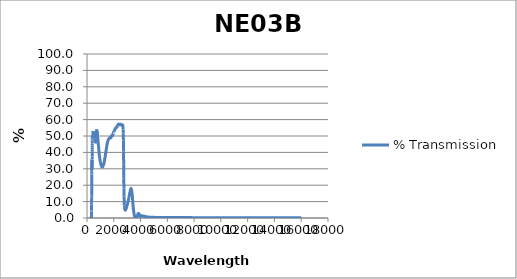
| Category | % Transmission |
|---|---|
| 200.0 | 0.014 |
| 201.0 | 0.014 |
| 202.0 | 0.014 |
| 203.0 | 0.014 |
| 204.0 | 0.014 |
| 205.0 | 0.014 |
| 206.0 | 0.014 |
| 207.0 | 0.013 |
| 208.0 | 0.014 |
| 209.0 | 0.013 |
| 210.0 | 0.013 |
| 211.0 | 0.013 |
| 212.0 | 0.013 |
| 213.0 | 0.013 |
| 214.0 | 0.013 |
| 215.0 | 0.013 |
| 216.0 | 0.013 |
| 217.0 | 0.012 |
| 218.0 | 0.012 |
| 219.0 | 0.012 |
| 220.0 | 0.012 |
| 221.0 | 0.012 |
| 222.0 | 0.012 |
| 223.0 | 0.012 |
| 224.0 | 0.012 |
| 225.0 | 0.012 |
| 226.0 | 0.012 |
| 227.0 | 0.012 |
| 228.0 | 0.012 |
| 229.0 | 0.011 |
| 230.0 | 0.011 |
| 231.0 | 0.011 |
| 232.0 | 0.011 |
| 233.0 | 0.011 |
| 234.0 | 0.011 |
| 235.0 | 0.011 |
| 236.0 | 0.011 |
| 237.0 | 0.011 |
| 238.0 | 0.011 |
| 239.0 | 0.011 |
| 240.0 | 0.011 |
| 241.0 | 0.011 |
| 242.0 | 0.011 |
| 243.0 | 0.011 |
| 244.0 | 0.011 |
| 245.0 | 0.01 |
| 246.0 | 0.01 |
| 247.0 | 0.01 |
| 248.0 | 0.01 |
| 249.0 | 0.01 |
| 250.0 | 0.01 |
| 251.0 | 0.01 |
| 252.0 | 0.01 |
| 253.0 | 0.01 |
| 254.0 | 0.01 |
| 255.0 | 0.01 |
| 256.0 | 0.01 |
| 257.0 | 0.01 |
| 258.0 | 0.01 |
| 259.0 | 0.01 |
| 260.0 | 0.01 |
| 261.0 | 0.01 |
| 262.0 | 0.01 |
| 263.0 | 0.01 |
| 264.0 | 0.01 |
| 265.0 | 0.01 |
| 266.0 | 0.01 |
| 267.0 | 0.01 |
| 268.0 | 0.01 |
| 269.0 | 0.009 |
| 270.0 | 0.009 |
| 271.0 | 0.009 |
| 272.0 | 0.009 |
| 273.0 | 0.009 |
| 274.0 | 0.009 |
| 275.0 | 0.009 |
| 276.0 | 0.009 |
| 277.0 | 0.009 |
| 278.0 | 0.009 |
| 279.0 | 0.009 |
| 280.0 | 0.009 |
| 281.0 | 0.009 |
| 282.0 | 0.009 |
| 283.0 | 0.009 |
| 284.0 | 0.009 |
| 285.0 | 0.009 |
| 286.0 | 0.009 |
| 287.0 | 0.009 |
| 288.0 | 0.009 |
| 289.0 | 0.009 |
| 290.0 | 0.009 |
| 291.0 | 0.009 |
| 292.0 | 0.009 |
| 293.0 | 0.009 |
| 294.0 | 0.009 |
| 295.0 | 0.009 |
| 296.0 | 0.009 |
| 297.0 | 0.009 |
| 298.0 | 0.009 |
| 299.0 | 0.009 |
| 300.0 | 0.009 |
| 301.0 | 0.009 |
| 302.0 | 0.009 |
| 303.0 | 0.009 |
| 304.0 | 0.009 |
| 305.0 | 0.009 |
| 306.0 | 0.009 |
| 307.0 | 0.009 |
| 308.0 | 0.008 |
| 309.0 | 0.009 |
| 310.0 | 0.009 |
| 311.0 | 0.008 |
| 312.0 | 0.008 |
| 313.0 | 0.008 |
| 314.0 | 0.008 |
| 315.0 | 0.008 |
| 316.0 | 0.009 |
| 317.0 | 0.009 |
| 318.0 | 0.01 |
| 319.0 | 0.01 |
| 320.0 | 0.013 |
| 321.0 | 0.018 |
| 322.0 | 0.026 |
| 323.0 | 0.039 |
| 324.0 | 0.06 |
| 325.0 | 0.092 |
| 326.0 | 0.138 |
| 327.0 | 0.206 |
| 328.0 | 0.3 |
| 329.0 | 0.424 |
| 330.0 | 0.588 |
| 331.0 | 0.796 |
| 332.0 | 1.056 |
| 333.0 | 1.367 |
| 334.0 | 1.736 |
| 335.0 | 2.16 |
| 336.0 | 2.658 |
| 337.0 | 3.246 |
| 338.0 | 3.903 |
| 339.0 | 4.662 |
| 340.0 | 5.47 |
| 341.0 | 6.323 |
| 342.0 | 7.248 |
| 343.0 | 8.2 |
| 344.0 | 9.247 |
| 345.0 | 10.342 |
| 346.0 | 11.501 |
| 347.0 | 12.595 |
| 348.0 | 13.826 |
| 349.0 | 15.064 |
| 350.0 | 16.359 |
| 351.0 | 17.702 |
| 352.0 | 18.977 |
| 353.0 | 20.066 |
| 354.0 | 21.304 |
| 355.0 | 22.543 |
| 356.0 | 23.813 |
| 357.0 | 25.089 |
| 358.0 | 26.323 |
| 359.0 | 27.287 |
| 360.0 | 28.412 |
| 361.0 | 29.467 |
| 362.0 | 30.585 |
| 363.0 | 31.574 |
| 364.0 | 32.527 |
| 365.0 | 33.163 |
| 366.0 | 33.889 |
| 367.0 | 34.378 |
| 368.0 | 34.846 |
| 369.0 | 35.214 |
| 370.0 | 35.203 |
| 371.0 | 34.632 |
| 372.0 | 33.98 |
| 373.0 | 33.103 |
| 374.0 | 32.112 |
| 375.0 | 31.255 |
| 376.0 | 30.477 |
| 377.0 | 29.872 |
| 378.0 | 30.061 |
| 379.0 | 30.628 |
| 380.0 | 31.579 |
| 381.0 | 32.708 |
| 382.0 | 34.15 |
| 383.0 | 35.709 |
| 384.0 | 37.46 |
| 385.0 | 39.023 |
| 386.0 | 40.515 |
| 387.0 | 41.68 |
| 388.0 | 43.062 |
| 389.0 | 44.163 |
| 390.0 | 45.363 |
| 391.0 | 46.266 |
| 392.0 | 47.028 |
| 393.0 | 47.401 |
| 394.0 | 48.068 |
| 395.0 | 48.579 |
| 396.0 | 49.251 |
| 397.0 | 49.554 |
| 398.0 | 49.923 |
| 399.0 | 49.828 |
| 400.0 | 49.993 |
| 401.0 | 50.052 |
| 402.0 | 50.28 |
| 403.0 | 50.276 |
| 404.0 | 50.241 |
| 405.0 | 49.819 |
| 406.0 | 49.731 |
| 407.0 | 49.61 |
| 408.0 | 49.769 |
| 409.0 | 49.521 |
| 410.0 | 49.354 |
| 411.0 | 49.016 |
| 412.0 | 49.022 |
| 413.0 | 48.95 |
| 414.0 | 49.072 |
| 415.0 | 49.078 |
| 416.0 | 49.085 |
| 417.0 | 48.899 |
| 418.0 | 49.005 |
| 419.0 | 49.172 |
| 420.0 | 49.361 |
| 421.0 | 49.67 |
| 422.0 | 49.698 |
| 423.0 | 49.586 |
| 424.0 | 49.761 |
| 425.0 | 49.93 |
| 426.0 | 50.146 |
| 427.0 | 50.463 |
| 428.0 | 50.457 |
| 429.0 | 50.325 |
| 430.0 | 50.357 |
| 431.0 | 50.438 |
| 432.0 | 50.513 |
| 433.0 | 50.598 |
| 434.0 | 50.408 |
| 435.0 | 50.159 |
| 436.0 | 50.026 |
| 437.0 | 49.959 |
| 438.0 | 50.012 |
| 439.0 | 50.141 |
| 440.0 | 50.025 |
| 441.0 | 49.801 |
| 442.0 | 49.821 |
| 443.0 | 49.996 |
| 444.0 | 50.21 |
| 445.0 | 50.537 |
| 446.0 | 50.626 |
| 447.0 | 50.609 |
| 448.0 | 50.818 |
| 449.0 | 51.058 |
| 450.0 | 51.382 |
| 451.0 | 51.848 |
| 452.0 | 51.931 |
| 453.0 | 51.883 |
| 454.0 | 52.029 |
| 455.0 | 52.154 |
| 456.0 | 52.44 |
| 457.0 | 52.794 |
| 458.0 | 52.805 |
| 459.0 | 52.655 |
| 460.0 | 52.642 |
| 461.0 | 52.72 |
| 462.0 | 52.88 |
| 463.0 | 53.048 |
| 464.0 | 52.906 |
| 465.0 | 52.661 |
| 466.0 | 52.652 |
| 467.0 | 52.599 |
| 468.0 | 52.668 |
| 469.0 | 52.792 |
| 470.0 | 52.51 |
| 471.0 | 52.223 |
| 472.0 | 52.172 |
| 473.0 | 52.153 |
| 474.0 | 52.211 |
| 475.0 | 52.153 |
| 476.0 | 52.008 |
| 477.0 | 51.759 |
| 478.0 | 51.635 |
| 479.0 | 51.54 |
| 480.0 | 51.632 |
| 481.0 | 51.638 |
| 482.0 | 51.442 |
| 483.0 | 51.12 |
| 484.0 | 50.993 |
| 485.0 | 50.902 |
| 486.0 | 50.982 |
| 487.0 | 51.07 |
| 488.0 | 50.827 |
| 489.0 | 50.538 |
| 490.0 | 50.462 |
| 491.0 | 50.414 |
| 492.0 | 50.501 |
| 493.0 | 50.585 |
| 494.0 | 50.355 |
| 495.0 | 50.195 |
| 496.0 | 50.166 |
| 497.0 | 50.18 |
| 498.0 | 50.316 |
| 499.0 | 50.312 |
| 500.0 | 50.098 |
| 501.0 | 49.834 |
| 502.0 | 49.814 |
| 503.0 | 49.844 |
| 504.0 | 49.964 |
| 505.0 | 50.103 |
| 506.0 | 49.922 |
| 507.0 | 49.738 |
| 508.0 | 49.728 |
| 509.0 | 49.702 |
| 510.0 | 49.874 |
| 511.0 | 50.043 |
| 512.0 | 49.87 |
| 513.0 | 49.754 |
| 514.0 | 49.786 |
| 515.0 | 49.833 |
| 516.0 | 50.054 |
| 517.0 | 50.256 |
| 518.0 | 50.112 |
| 519.0 | 49.988 |
| 520.0 | 50.031 |
| 521.0 | 50.125 |
| 522.0 | 50.347 |
| 523.0 | 50.521 |
| 524.0 | 50.415 |
| 525.0 | 50.32 |
| 526.0 | 50.399 |
| 527.0 | 50.5 |
| 528.0 | 50.76 |
| 529.0 | 50.966 |
| 530.0 | 50.83 |
| 531.0 | 50.766 |
| 532.0 | 50.853 |
| 533.0 | 50.944 |
| 534.0 | 51.182 |
| 535.0 | 51.368 |
| 536.0 | 51.292 |
| 537.0 | 51.208 |
| 538.0 | 51.283 |
| 539.0 | 51.363 |
| 540.0 | 51.6 |
| 541.0 | 51.739 |
| 542.0 | 51.536 |
| 543.0 | 51.411 |
| 544.0 | 51.455 |
| 545.0 | 51.616 |
| 546.0 | 51.775 |
| 547.0 | 51.834 |
| 548.0 | 51.569 |
| 549.0 | 51.405 |
| 550.0 | 51.415 |
| 551.0 | 51.516 |
| 552.0 | 51.643 |
| 553.0 | 51.465 |
| 554.0 | 51.311 |
| 555.0 | 51.22 |
| 556.0 | 51.185 |
| 557.0 | 51.281 |
| 558.0 | 51.319 |
| 559.0 | 51.228 |
| 560.0 | 50.945 |
| 561.0 | 50.91 |
| 562.0 | 50.691 |
| 563.0 | 50.565 |
| 564.0 | 50.425 |
| 565.0 | 50.486 |
| 566.0 | 50.448 |
| 567.0 | 50.165 |
| 568.0 | 49.896 |
| 569.0 | 49.688 |
| 570.0 | 49.528 |
| 571.0 | 49.481 |
| 572.0 | 49.548 |
| 573.0 | 49.334 |
| 574.0 | 49.08 |
| 575.0 | 48.873 |
| 576.0 | 48.7 |
| 577.0 | 48.682 |
| 578.0 | 48.678 |
| 579.0 | 48.463 |
| 580.0 | 48.151 |
| 581.0 | 47.982 |
| 582.0 | 47.892 |
| 583.0 | 47.937 |
| 584.0 | 47.905 |
| 585.0 | 47.715 |
| 586.0 | 47.536 |
| 587.0 | 47.36 |
| 588.0 | 47.275 |
| 589.0 | 47.338 |
| 590.0 | 47.389 |
| 591.0 | 47.251 |
| 592.0 | 47.117 |
| 593.0 | 47.097 |
| 594.0 | 47.013 |
| 595.0 | 47.184 |
| 596.0 | 47.241 |
| 597.0 | 47.159 |
| 598.0 | 47.036 |
| 599.0 | 47.1 |
| 600.0 | 47.089 |
| 601.0 | 47.143 |
| 602.0 | 47.265 |
| 603.0 | 47.211 |
| 604.0 | 47.138 |
| 605.0 | 47.184 |
| 606.0 | 47.17 |
| 607.0 | 47.335 |
| 608.0 | 47.443 |
| 609.0 | 47.417 |
| 610.0 | 47.297 |
| 611.0 | 47.459 |
| 612.0 | 47.386 |
| 613.0 | 47.545 |
| 614.0 | 47.607 |
| 615.0 | 47.536 |
| 616.0 | 47.449 |
| 617.0 | 47.44 |
| 618.0 | 47.477 |
| 619.0 | 47.622 |
| 620.0 | 47.72 |
| 621.0 | 47.565 |
| 622.0 | 47.48 |
| 623.0 | 47.577 |
| 624.0 | 47.503 |
| 625.0 | 47.725 |
| 626.0 | 47.716 |
| 627.0 | 47.442 |
| 628.0 | 47.328 |
| 629.0 | 47.364 |
| 630.0 | 47.28 |
| 631.0 | 47.306 |
| 632.0 | 47.269 |
| 633.0 | 47.047 |
| 634.0 | 46.931 |
| 635.0 | 46.951 |
| 636.0 | 46.897 |
| 637.0 | 46.901 |
| 638.0 | 46.944 |
| 639.0 | 46.66 |
| 640.0 | 46.58 |
| 641.0 | 46.533 |
| 642.0 | 46.532 |
| 643.0 | 46.539 |
| 644.0 | 46.479 |
| 645.0 | 46.301 |
| 646.0 | 46.253 |
| 647.0 | 46.279 |
| 648.0 | 46.226 |
| 649.0 | 46.308 |
| 650.0 | 46.308 |
| 651.0 | 46.084 |
| 652.0 | 46.082 |
| 653.0 | 46.029 |
| 654.0 | 46.089 |
| 655.0 | 46.281 |
| 656.0 | 46.433 |
| 657.0 | 46.065 |
| 658.0 | 46.104 |
| 659.0 | 46.282 |
| 660.0 | 46.304 |
| 661.0 | 46.564 |
| 662.0 | 46.492 |
| 663.0 | 46.442 |
| 664.0 | 46.481 |
| 665.0 | 46.658 |
| 666.0 | 46.778 |
| 667.0 | 46.996 |
| 668.0 | 47.238 |
| 669.0 | 47.171 |
| 670.0 | 47.266 |
| 671.0 | 47.411 |
| 672.0 | 47.78 |
| 673.0 | 48.032 |
| 674.0 | 48.091 |
| 675.0 | 48.146 |
| 676.0 | 48.224 |
| 677.0 | 48.476 |
| 678.0 | 48.71 |
| 679.0 | 49.147 |
| 680.0 | 49.333 |
| 681.0 | 49.328 |
| 682.0 | 49.61 |
| 683.0 | 50.004 |
| 684.0 | 50.211 |
| 685.0 | 50.629 |
| 686.0 | 50.604 |
| 687.0 | 50.673 |
| 688.0 | 50.789 |
| 689.0 | 51.332 |
| 690.0 | 51.318 |
| 691.0 | 51.495 |
| 692.0 | 51.78 |
| 693.0 | 51.987 |
| 694.0 | 51.916 |
| 695.0 | 52.163 |
| 696.0 | 52.185 |
| 697.0 | 52.548 |
| 698.0 | 52.895 |
| 699.0 | 52.685 |
| 700.0 | 52.648 |
| 701.0 | 52.909 |
| 702.0 | 52.943 |
| 703.0 | 53.177 |
| 704.0 | 53.384 |
| 705.0 | 53.326 |
| 706.0 | 53.218 |
| 707.0 | 53.258 |
| 708.0 | 53.182 |
| 709.0 | 53.518 |
| 710.0 | 53.795 |
| 711.0 | 53.37 |
| 712.0 | 53.522 |
| 713.0 | 53.528 |
| 714.0 | 53.445 |
| 715.0 | 53.717 |
| 716.0 | 53.782 |
| 717.0 | 53.567 |
| 718.0 | 53.452 |
| 719.0 | 53.52 |
| 720.0 | 53.381 |
| 721.0 | 53.597 |
| 722.0 | 53.607 |
| 723.0 | 53.375 |
| 724.0 | 53.234 |
| 725.0 | 53.186 |
| 726.0 | 53.221 |
| 727.0 | 53.286 |
| 728.0 | 53.362 |
| 729.0 | 53.059 |
| 730.0 | 52.958 |
| 731.0 | 52.881 |
| 732.0 | 52.763 |
| 733.0 | 52.855 |
| 734.0 | 53.055 |
| 735.0 | 52.667 |
| 736.0 | 52.59 |
| 737.0 | 52.579 |
| 738.0 | 52.407 |
| 739.0 | 52.568 |
| 740.0 | 52.704 |
| 741.0 | 52.263 |
| 742.0 | 52.17 |
| 743.0 | 52.139 |
| 744.0 | 52.057 |
| 745.0 | 52.009 |
| 746.0 | 52.232 |
| 747.0 | 51.893 |
| 748.0 | 51.625 |
| 749.0 | 51.569 |
| 750.0 | 52.508 |
| 751.0 | 52.475 |
| 752.0 | 52.434 |
| 753.0 | 52.403 |
| 754.0 | 52.374 |
| 755.0 | 52.345 |
| 756.0 | 52.318 |
| 757.0 | 52.283 |
| 758.0 | 52.236 |
| 759.0 | 52.202 |
| 760.0 | 52.168 |
| 761.0 | 52.132 |
| 762.0 | 52.099 |
| 763.0 | 52.055 |
| 764.0 | 52.001 |
| 765.0 | 51.963 |
| 766.0 | 51.925 |
| 767.0 | 51.885 |
| 768.0 | 51.844 |
| 769.0 | 51.801 |
| 770.0 | 51.744 |
| 771.0 | 51.697 |
| 772.0 | 51.658 |
| 773.0 | 51.617 |
| 774.0 | 51.532 |
| 775.0 | 51.446 |
| 776.0 | 51.359 |
| 777.0 | 51.271 |
| 778.0 | 51.182 |
| 779.0 | 51.093 |
| 780.0 | 51.003 |
| 781.0 | 50.912 |
| 782.0 | 50.821 |
| 783.0 | 50.728 |
| 784.0 | 50.635 |
| 785.0 | 50.542 |
| 786.0 | 50.448 |
| 787.0 | 50.353 |
| 788.0 | 50.258 |
| 789.0 | 50.162 |
| 790.0 | 50.067 |
| 791.0 | 49.971 |
| 792.0 | 49.875 |
| 793.0 | 49.78 |
| 794.0 | 49.685 |
| 795.0 | 49.589 |
| 796.0 | 49.495 |
| 797.0 | 49.4 |
| 798.0 | 49.304 |
| 799.0 | 49.209 |
| 800.0 | 49.114 |
| 801.0 | 49.018 |
| 802.0 | 48.923 |
| 803.0 | 48.828 |
| 804.0 | 48.732 |
| 805.0 | 48.637 |
| 806.0 | 48.543 |
| 807.0 | 48.449 |
| 808.0 | 48.355 |
| 809.0 | 48.261 |
| 810.0 | 48.168 |
| 811.0 | 48.075 |
| 812.0 | 47.983 |
| 813.0 | 47.889 |
| 814.0 | 47.796 |
| 815.0 | 47.703 |
| 816.0 | 47.61 |
| 817.0 | 47.518 |
| 818.0 | 47.425 |
| 819.0 | 47.332 |
| 820.0 | 47.238 |
| 821.0 | 47.146 |
| 822.0 | 47.053 |
| 823.0 | 46.962 |
| 824.0 | 46.87 |
| 825.0 | 46.777 |
| 826.0 | 46.685 |
| 827.0 | 46.594 |
| 828.0 | 46.502 |
| 829.0 | 46.411 |
| 830.0 | 46.319 |
| 831.0 | 46.228 |
| 832.0 | 46.136 |
| 833.0 | 46.045 |
| 834.0 | 45.955 |
| 835.0 | 45.865 |
| 836.0 | 45.777 |
| 837.0 | 45.689 |
| 838.0 | 45.601 |
| 839.0 | 45.513 |
| 840.0 | 45.425 |
| 841.0 | 45.338 |
| 842.0 | 45.252 |
| 843.0 | 45.166 |
| 844.0 | 45.08 |
| 845.0 | 44.994 |
| 846.0 | 44.909 |
| 847.0 | 44.824 |
| 848.0 | 44.741 |
| 849.0 | 44.658 |
| 850.0 | 44.576 |
| 851.0 | 44.493 |
| 852.0 | 44.411 |
| 853.0 | 44.33 |
| 854.0 | 44.249 |
| 855.0 | 44.169 |
| 856.0 | 44.09 |
| 857.0 | 44.01 |
| 858.0 | 43.929 |
| 859.0 | 43.849 |
| 860.0 | 43.769 |
| 861.0 | 43.69 |
| 862.0 | 43.611 |
| 863.0 | 43.53 |
| 864.0 | 43.449 |
| 865.0 | 43.367 |
| 866.0 | 43.285 |
| 867.0 | 43.203 |
| 868.0 | 43.118 |
| 869.0 | 43.031 |
| 870.0 | 42.942 |
| 871.0 | 42.85 |
| 872.0 | 42.758 |
| 873.0 | 42.662 |
| 874.0 | 42.563 |
| 875.0 | 42.462 |
| 876.0 | 42.359 |
| 877.0 | 42.257 |
| 878.0 | 42.155 |
| 879.0 | 42.05 |
| 880.0 | 41.944 |
| 881.0 | 41.836 |
| 882.0 | 41.724 |
| 883.0 | 41.61 |
| 884.0 | 41.493 |
| 885.0 | 41.376 |
| 886.0 | 41.257 |
| 887.0 | 41.138 |
| 888.0 | 41.019 |
| 889.0 | 40.902 |
| 890.0 | 40.786 |
| 891.0 | 40.673 |
| 892.0 | 40.562 |
| 893.0 | 40.453 |
| 894.0 | 40.344 |
| 895.0 | 40.237 |
| 896.0 | 40.137 |
| 897.0 | 40.044 |
| 898.0 | 39.954 |
| 899.0 | 39.866 |
| 900.0 | 39.776 |
| 901.0 | 39.684 |
| 902.0 | 39.594 |
| 903.0 | 39.506 |
| 904.0 | 39.422 |
| 905.0 | 39.341 |
| 906.0 | 39.263 |
| 907.0 | 39.188 |
| 908.0 | 39.116 |
| 909.0 | 39.046 |
| 910.0 | 38.978 |
| 911.0 | 38.913 |
| 912.0 | 38.849 |
| 913.0 | 38.785 |
| 914.0 | 38.719 |
| 915.0 | 38.652 |
| 916.0 | 38.59 |
| 917.0 | 38.53 |
| 918.0 | 38.469 |
| 919.0 | 38.404 |
| 920.0 | 38.337 |
| 921.0 | 38.267 |
| 922.0 | 38.193 |
| 923.0 | 38.121 |
| 924.0 | 38.053 |
| 925.0 | 37.99 |
| 926.0 | 37.927 |
| 927.0 | 37.862 |
| 928.0 | 37.797 |
| 929.0 | 37.736 |
| 930.0 | 37.677 |
| 931.0 | 37.614 |
| 932.0 | 37.553 |
| 933.0 | 37.497 |
| 934.0 | 37.436 |
| 935.0 | 37.369 |
| 936.0 | 37.303 |
| 937.0 | 37.24 |
| 938.0 | 37.182 |
| 939.0 | 37.123 |
| 940.0 | 37.062 |
| 941.0 | 36.999 |
| 942.0 | 36.936 |
| 943.0 | 36.874 |
| 944.0 | 36.818 |
| 945.0 | 36.767 |
| 946.0 | 36.717 |
| 947.0 | 36.662 |
| 948.0 | 36.604 |
| 949.0 | 36.547 |
| 950.0 | 36.495 |
| 951.0 | 36.445 |
| 952.0 | 36.388 |
| 953.0 | 36.329 |
| 954.0 | 36.276 |
| 955.0 | 36.222 |
| 956.0 | 36.161 |
| 957.0 | 36.101 |
| 958.0 | 36.046 |
| 959.0 | 35.992 |
| 960.0 | 35.939 |
| 961.0 | 35.884 |
| 962.0 | 35.827 |
| 963.0 | 35.769 |
| 964.0 | 35.716 |
| 965.0 | 35.668 |
| 966.0 | 35.62 |
| 967.0 | 35.568 |
| 968.0 | 35.513 |
| 969.0 | 35.46 |
| 970.0 | 35.411 |
| 971.0 | 35.366 |
| 972.0 | 35.316 |
| 973.0 | 35.258 |
| 974.0 | 35.2 |
| 975.0 | 35.148 |
| 976.0 | 35.1 |
| 977.0 | 35.05 |
| 978.0 | 34.998 |
| 979.0 | 34.95 |
| 980.0 | 34.905 |
| 981.0 | 34.861 |
| 982.0 | 34.816 |
| 983.0 | 34.769 |
| 984.0 | 34.722 |
| 985.0 | 34.676 |
| 986.0 | 34.632 |
| 987.0 | 34.587 |
| 988.0 | 34.539 |
| 989.0 | 34.491 |
| 990.0 | 34.441 |
| 991.0 | 34.393 |
| 992.0 | 34.347 |
| 993.0 | 34.297 |
| 994.0 | 34.248 |
| 995.0 | 34.205 |
| 996.0 | 34.169 |
| 997.0 | 34.131 |
| 998.0 | 34.091 |
| 999.0 | 34.049 |
| 1000.0 | 34.005 |
| 1001.0 | 33.962 |
| 1002.0 | 33.921 |
| 1003.0 | 33.882 |
| 1004.0 | 33.842 |
| 1005.0 | 33.802 |
| 1006.0 | 33.763 |
| 1007.0 | 33.722 |
| 1008.0 | 33.683 |
| 1009.0 | 33.646 |
| 1010.0 | 33.609 |
| 1011.0 | 33.572 |
| 1012.0 | 33.536 |
| 1013.0 | 33.507 |
| 1014.0 | 33.478 |
| 1015.0 | 33.449 |
| 1016.0 | 33.422 |
| 1017.0 | 33.39 |
| 1018.0 | 33.353 |
| 1019.0 | 33.316 |
| 1020.0 | 33.281 |
| 1021.0 | 33.251 |
| 1022.0 | 33.221 |
| 1023.0 | 33.191 |
| 1024.0 | 33.157 |
| 1025.0 | 33.123 |
| 1026.0 | 33.088 |
| 1027.0 | 33.052 |
| 1028.0 | 33.017 |
| 1029.0 | 32.984 |
| 1030.0 | 32.955 |
| 1031.0 | 32.923 |
| 1032.0 | 32.889 |
| 1033.0 | 32.854 |
| 1034.0 | 32.822 |
| 1035.0 | 32.788 |
| 1036.0 | 32.752 |
| 1037.0 | 32.714 |
| 1038.0 | 32.675 |
| 1039.0 | 32.636 |
| 1040.0 | 32.602 |
| 1041.0 | 32.571 |
| 1042.0 | 32.536 |
| 1043.0 | 32.5 |
| 1044.0 | 32.462 |
| 1045.0 | 32.426 |
| 1046.0 | 32.394 |
| 1047.0 | 32.366 |
| 1048.0 | 32.338 |
| 1049.0 | 32.311 |
| 1050.0 | 32.286 |
| 1051.0 | 32.264 |
| 1052.0 | 32.242 |
| 1053.0 | 32.216 |
| 1054.0 | 32.19 |
| 1055.0 | 32.163 |
| 1056.0 | 32.134 |
| 1057.0 | 32.107 |
| 1058.0 | 32.083 |
| 1059.0 | 32.056 |
| 1060.0 | 32.028 |
| 1061.0 | 31.999 |
| 1062.0 | 31.971 |
| 1063.0 | 31.946 |
| 1064.0 | 31.926 |
| 1065.0 | 31.911 |
| 1066.0 | 31.895 |
| 1067.0 | 31.876 |
| 1068.0 | 31.855 |
| 1069.0 | 31.832 |
| 1070.0 | 31.808 |
| 1071.0 | 31.786 |
| 1072.0 | 31.76 |
| 1073.0 | 31.732 |
| 1074.0 | 31.705 |
| 1075.0 | 31.678 |
| 1076.0 | 31.654 |
| 1077.0 | 31.632 |
| 1078.0 | 31.614 |
| 1079.0 | 31.6 |
| 1080.0 | 31.585 |
| 1081.0 | 31.572 |
| 1082.0 | 31.562 |
| 1083.0 | 31.556 |
| 1084.0 | 31.552 |
| 1085.0 | 31.545 |
| 1086.0 | 31.531 |
| 1087.0 | 31.513 |
| 1088.0 | 31.493 |
| 1089.0 | 31.476 |
| 1090.0 | 31.464 |
| 1091.0 | 31.453 |
| 1092.0 | 31.443 |
| 1093.0 | 31.433 |
| 1094.0 | 31.425 |
| 1095.0 | 31.422 |
| 1096.0 | 31.418 |
| 1097.0 | 31.412 |
| 1098.0 | 31.404 |
| 1099.0 | 31.394 |
| 1100.0 | 31.386 |
| 1101.0 | 31.377 |
| 1102.0 | 31.367 |
| 1103.0 | 31.355 |
| 1104.0 | 31.34 |
| 1105.0 | 31.324 |
| 1106.0 | 31.307 |
| 1107.0 | 31.29 |
| 1108.0 | 31.277 |
| 1109.0 | 31.268 |
| 1110.0 | 31.258 |
| 1111.0 | 31.244 |
| 1112.0 | 31.227 |
| 1113.0 | 31.21 |
| 1114.0 | 31.193 |
| 1115.0 | 31.178 |
| 1116.0 | 31.165 |
| 1117.0 | 31.155 |
| 1118.0 | 31.142 |
| 1119.0 | 31.131 |
| 1120.0 | 31.121 |
| 1121.0 | 31.112 |
| 1122.0 | 31.106 |
| 1123.0 | 31.102 |
| 1124.0 | 31.1 |
| 1125.0 | 31.099 |
| 1126.0 | 31.096 |
| 1127.0 | 31.095 |
| 1128.0 | 31.095 |
| 1129.0 | 31.097 |
| 1130.0 | 31.102 |
| 1131.0 | 31.106 |
| 1132.0 | 31.109 |
| 1133.0 | 31.113 |
| 1134.0 | 31.12 |
| 1135.0 | 31.13 |
| 1136.0 | 31.143 |
| 1137.0 | 31.156 |
| 1138.0 | 31.167 |
| 1139.0 | 31.174 |
| 1140.0 | 31.177 |
| 1141.0 | 31.179 |
| 1142.0 | 31.181 |
| 1143.0 | 31.181 |
| 1144.0 | 31.18 |
| 1145.0 | 31.175 |
| 1146.0 | 31.166 |
| 1147.0 | 31.154 |
| 1148.0 | 31.146 |
| 1149.0 | 31.142 |
| 1150.0 | 31.142 |
| 1151.0 | 31.139 |
| 1152.0 | 31.135 |
| 1153.0 | 31.127 |
| 1154.0 | 31.12 |
| 1155.0 | 31.116 |
| 1156.0 | 31.119 |
| 1157.0 | 31.125 |
| 1158.0 | 31.129 |
| 1159.0 | 31.124 |
| 1160.0 | 31.116 |
| 1161.0 | 31.109 |
| 1162.0 | 31.105 |
| 1163.0 | 31.106 |
| 1164.0 | 31.108 |
| 1165.0 | 31.113 |
| 1166.0 | 31.122 |
| 1167.0 | 31.136 |
| 1168.0 | 31.155 |
| 1169.0 | 31.18 |
| 1170.0 | 31.207 |
| 1171.0 | 31.229 |
| 1172.0 | 31.247 |
| 1173.0 | 31.261 |
| 1174.0 | 31.276 |
| 1175.0 | 31.289 |
| 1176.0 | 31.301 |
| 1177.0 | 31.31 |
| 1178.0 | 31.316 |
| 1179.0 | 31.32 |
| 1180.0 | 31.325 |
| 1181.0 | 31.335 |
| 1182.0 | 31.355 |
| 1183.0 | 31.381 |
| 1184.0 | 31.409 |
| 1185.0 | 31.438 |
| 1186.0 | 31.468 |
| 1187.0 | 31.498 |
| 1188.0 | 31.53 |
| 1189.0 | 31.564 |
| 1190.0 | 31.601 |
| 1191.0 | 31.639 |
| 1192.0 | 31.674 |
| 1193.0 | 31.706 |
| 1194.0 | 31.74 |
| 1195.0 | 31.774 |
| 1196.0 | 31.807 |
| 1197.0 | 31.841 |
| 1198.0 | 31.879 |
| 1199.0 | 31.925 |
| 1200.0 | 31.977 |
| 1201.0 | 32.031 |
| 1202.0 | 32.083 |
| 1203.0 | 32.133 |
| 1204.0 | 32.178 |
| 1205.0 | 32.22 |
| 1206.0 | 32.26 |
| 1207.0 | 32.299 |
| 1208.0 | 32.336 |
| 1209.0 | 32.369 |
| 1210.0 | 32.398 |
| 1211.0 | 32.422 |
| 1212.0 | 32.437 |
| 1213.0 | 32.442 |
| 1214.0 | 32.44 |
| 1215.0 | 32.439 |
| 1216.0 | 32.44 |
| 1217.0 | 32.443 |
| 1218.0 | 32.449 |
| 1219.0 | 32.46 |
| 1220.0 | 32.475 |
| 1221.0 | 32.489 |
| 1222.0 | 32.495 |
| 1223.0 | 32.497 |
| 1224.0 | 32.499 |
| 1225.0 | 32.502 |
| 1226.0 | 32.505 |
| 1227.0 | 32.507 |
| 1228.0 | 32.506 |
| 1229.0 | 32.498 |
| 1230.0 | 32.487 |
| 1231.0 | 32.476 |
| 1232.0 | 32.464 |
| 1233.0 | 32.453 |
| 1234.0 | 32.444 |
| 1235.0 | 32.441 |
| 1236.0 | 32.447 |
| 1237.0 | 32.459 |
| 1238.0 | 32.472 |
| 1239.0 | 32.485 |
| 1240.0 | 32.499 |
| 1241.0 | 32.513 |
| 1242.0 | 32.528 |
| 1243.0 | 32.542 |
| 1244.0 | 32.557 |
| 1245.0 | 32.578 |
| 1246.0 | 32.601 |
| 1247.0 | 32.622 |
| 1248.0 | 32.642 |
| 1249.0 | 32.664 |
| 1250.0 | 32.69 |
| 1251.0 | 32.723 |
| 1252.0 | 32.762 |
| 1253.0 | 32.806 |
| 1254.0 | 32.853 |
| 1255.0 | 32.902 |
| 1256.0 | 32.953 |
| 1257.0 | 33.005 |
| 1258.0 | 33.056 |
| 1259.0 | 33.101 |
| 1260.0 | 33.144 |
| 1261.0 | 33.191 |
| 1262.0 | 33.239 |
| 1263.0 | 33.287 |
| 1264.0 | 33.327 |
| 1265.0 | 33.359 |
| 1266.0 | 33.387 |
| 1267.0 | 33.411 |
| 1268.0 | 33.432 |
| 1269.0 | 33.451 |
| 1270.0 | 33.471 |
| 1271.0 | 33.493 |
| 1272.0 | 33.515 |
| 1273.0 | 33.535 |
| 1274.0 | 33.555 |
| 1275.0 | 33.574 |
| 1276.0 | 33.593 |
| 1277.0 | 33.614 |
| 1278.0 | 33.639 |
| 1279.0 | 33.666 |
| 1280.0 | 33.696 |
| 1281.0 | 33.73 |
| 1282.0 | 33.766 |
| 1283.0 | 33.8 |
| 1284.0 | 33.83 |
| 1285.0 | 33.857 |
| 1286.0 | 33.885 |
| 1287.0 | 33.924 |
| 1288.0 | 33.976 |
| 1289.0 | 34.035 |
| 1290.0 | 34.099 |
| 1291.0 | 34.166 |
| 1292.0 | 34.236 |
| 1293.0 | 34.308 |
| 1294.0 | 34.38 |
| 1295.0 | 34.452 |
| 1296.0 | 34.523 |
| 1297.0 | 34.593 |
| 1298.0 | 34.663 |
| 1299.0 | 34.731 |
| 1300.0 | 34.798 |
| 1301.0 | 34.864 |
| 1302.0 | 34.927 |
| 1303.0 | 34.985 |
| 1304.0 | 35.04 |
| 1305.0 | 35.097 |
| 1306.0 | 35.158 |
| 1307.0 | 35.223 |
| 1308.0 | 35.291 |
| 1309.0 | 35.359 |
| 1310.0 | 35.42 |
| 1311.0 | 35.472 |
| 1312.0 | 35.518 |
| 1313.0 | 35.563 |
| 1314.0 | 35.607 |
| 1315.0 | 35.65 |
| 1316.0 | 35.695 |
| 1317.0 | 35.74 |
| 1318.0 | 35.787 |
| 1319.0 | 35.834 |
| 1320.0 | 35.88 |
| 1321.0 | 35.925 |
| 1322.0 | 35.968 |
| 1323.0 | 36.008 |
| 1324.0 | 36.045 |
| 1325.0 | 36.085 |
| 1326.0 | 36.13 |
| 1327.0 | 36.178 |
| 1328.0 | 36.225 |
| 1329.0 | 36.268 |
| 1330.0 | 36.306 |
| 1331.0 | 36.337 |
| 1332.0 | 36.361 |
| 1333.0 | 36.385 |
| 1334.0 | 36.409 |
| 1335.0 | 36.434 |
| 1336.0 | 36.46 |
| 1337.0 | 36.486 |
| 1338.0 | 36.51 |
| 1339.0 | 36.533 |
| 1340.0 | 36.553 |
| 1341.0 | 36.577 |
| 1342.0 | 36.609 |
| 1343.0 | 36.649 |
| 1344.0 | 36.695 |
| 1345.0 | 36.744 |
| 1346.0 | 36.792 |
| 1347.0 | 36.842 |
| 1348.0 | 36.894 |
| 1349.0 | 36.951 |
| 1350.0 | 37.011 |
| 1351.0 | 37.072 |
| 1352.0 | 37.135 |
| 1353.0 | 37.198 |
| 1354.0 | 37.264 |
| 1355.0 | 37.336 |
| 1356.0 | 37.421 |
| 1357.0 | 37.518 |
| 1358.0 | 37.62 |
| 1359.0 | 37.717 |
| 1360.0 | 37.801 |
| 1361.0 | 37.875 |
| 1362.0 | 37.953 |
| 1363.0 | 38.036 |
| 1364.0 | 38.115 |
| 1365.0 | 38.185 |
| 1366.0 | 38.244 |
| 1367.0 | 38.29 |
| 1368.0 | 38.329 |
| 1369.0 | 38.374 |
| 1370.0 | 38.418 |
| 1371.0 | 38.458 |
| 1372.0 | 38.492 |
| 1373.0 | 38.526 |
| 1374.0 | 38.557 |
| 1375.0 | 38.589 |
| 1376.0 | 38.637 |
| 1377.0 | 38.706 |
| 1378.0 | 38.783 |
| 1379.0 | 38.843 |
| 1380.0 | 38.871 |
| 1381.0 | 38.878 |
| 1382.0 | 38.888 |
| 1383.0 | 38.921 |
| 1384.0 | 38.98 |
| 1385.0 | 39.036 |
| 1386.0 | 39.079 |
| 1387.0 | 39.117 |
| 1388.0 | 39.161 |
| 1389.0 | 39.218 |
| 1390.0 | 39.298 |
| 1391.0 | 39.382 |
| 1392.0 | 39.46 |
| 1393.0 | 39.538 |
| 1394.0 | 39.608 |
| 1395.0 | 39.662 |
| 1396.0 | 39.715 |
| 1397.0 | 39.784 |
| 1398.0 | 39.845 |
| 1399.0 | 39.871 |
| 1400.0 | 39.864 |
| 1401.0 | 39.851 |
| 1402.0 | 39.867 |
| 1403.0 | 39.92 |
| 1404.0 | 39.999 |
| 1405.0 | 40.09 |
| 1406.0 | 40.166 |
| 1407.0 | 40.217 |
| 1408.0 | 40.257 |
| 1409.0 | 40.305 |
| 1410.0 | 40.364 |
| 1411.0 | 40.419 |
| 1412.0 | 40.45 |
| 1413.0 | 40.457 |
| 1414.0 | 40.469 |
| 1415.0 | 40.497 |
| 1416.0 | 40.531 |
| 1417.0 | 40.582 |
| 1418.0 | 40.65 |
| 1419.0 | 40.705 |
| 1420.0 | 40.733 |
| 1421.0 | 40.774 |
| 1422.0 | 40.851 |
| 1423.0 | 40.95 |
| 1424.0 | 41.031 |
| 1425.0 | 41.075 |
| 1426.0 | 41.101 |
| 1427.0 | 41.123 |
| 1428.0 | 41.142 |
| 1429.0 | 41.166 |
| 1430.0 | 41.206 |
| 1431.0 | 41.265 |
| 1432.0 | 41.327 |
| 1433.0 | 41.38 |
| 1434.0 | 41.437 |
| 1435.0 | 41.515 |
| 1436.0 | 41.607 |
| 1437.0 | 41.694 |
| 1438.0 | 41.761 |
| 1439.0 | 41.819 |
| 1440.0 | 41.869 |
| 1441.0 | 41.924 |
| 1442.0 | 41.992 |
| 1443.0 | 42.071 |
| 1444.0 | 42.139 |
| 1445.0 | 42.192 |
| 1446.0 | 42.242 |
| 1447.0 | 42.303 |
| 1448.0 | 42.377 |
| 1449.0 | 42.451 |
| 1450.0 | 42.523 |
| 1451.0 | 42.598 |
| 1452.0 | 42.673 |
| 1453.0 | 42.747 |
| 1454.0 | 42.809 |
| 1455.0 | 42.864 |
| 1456.0 | 42.916 |
| 1457.0 | 42.96 |
| 1458.0 | 42.993 |
| 1459.0 | 43.026 |
| 1460.0 | 43.063 |
| 1461.0 | 43.11 |
| 1462.0 | 43.159 |
| 1463.0 | 43.209 |
| 1464.0 | 43.254 |
| 1465.0 | 43.293 |
| 1466.0 | 43.331 |
| 1467.0 | 43.373 |
| 1468.0 | 43.416 |
| 1469.0 | 43.456 |
| 1470.0 | 43.501 |
| 1471.0 | 43.556 |
| 1472.0 | 43.618 |
| 1473.0 | 43.674 |
| 1474.0 | 43.717 |
| 1475.0 | 43.748 |
| 1476.0 | 43.768 |
| 1477.0 | 43.795 |
| 1478.0 | 43.828 |
| 1479.0 | 43.868 |
| 1480.0 | 43.913 |
| 1481.0 | 43.963 |
| 1482.0 | 44.009 |
| 1483.0 | 44.05 |
| 1484.0 | 44.087 |
| 1485.0 | 44.127 |
| 1486.0 | 44.164 |
| 1487.0 | 44.201 |
| 1488.0 | 44.24 |
| 1489.0 | 44.289 |
| 1490.0 | 44.343 |
| 1491.0 | 44.403 |
| 1492.0 | 44.467 |
| 1493.0 | 44.526 |
| 1494.0 | 44.575 |
| 1495.0 | 44.614 |
| 1496.0 | 44.654 |
| 1497.0 | 44.699 |
| 1498.0 | 44.754 |
| 1499.0 | 44.821 |
| 1500.0 | 44.887 |
| 1501.0 | 44.953 |
| 1502.0 | 45.015 |
| 1503.0 | 45.076 |
| 1504.0 | 45.134 |
| 1505.0 | 45.191 |
| 1506.0 | 45.251 |
| 1507.0 | 45.312 |
| 1508.0 | 45.372 |
| 1509.0 | 45.431 |
| 1510.0 | 45.487 |
| 1511.0 | 45.54 |
| 1512.0 | 45.584 |
| 1513.0 | 45.621 |
| 1514.0 | 45.651 |
| 1515.0 | 45.674 |
| 1516.0 | 45.698 |
| 1517.0 | 45.726 |
| 1518.0 | 45.761 |
| 1519.0 | 45.801 |
| 1520.0 | 45.845 |
| 1521.0 | 45.89 |
| 1522.0 | 45.924 |
| 1523.0 | 45.95 |
| 1524.0 | 45.971 |
| 1525.0 | 45.993 |
| 1526.0 | 46.015 |
| 1527.0 | 46.039 |
| 1528.0 | 46.067 |
| 1529.0 | 46.097 |
| 1530.0 | 46.123 |
| 1531.0 | 46.145 |
| 1532.0 | 46.169 |
| 1533.0 | 46.193 |
| 1534.0 | 46.218 |
| 1535.0 | 46.246 |
| 1536.0 | 46.273 |
| 1537.0 | 46.301 |
| 1538.0 | 46.333 |
| 1539.0 | 46.372 |
| 1540.0 | 46.414 |
| 1541.0 | 46.452 |
| 1542.0 | 46.48 |
| 1543.0 | 46.497 |
| 1544.0 | 46.506 |
| 1545.0 | 46.523 |
| 1546.0 | 46.546 |
| 1547.0 | 46.574 |
| 1548.0 | 46.604 |
| 1549.0 | 46.639 |
| 1550.0 | 46.677 |
| 1551.0 | 46.713 |
| 1552.0 | 46.74 |
| 1553.0 | 46.768 |
| 1554.0 | 46.795 |
| 1555.0 | 46.82 |
| 1556.0 | 46.849 |
| 1557.0 | 46.882 |
| 1558.0 | 46.916 |
| 1559.0 | 46.955 |
| 1560.0 | 46.993 |
| 1561.0 | 47.024 |
| 1562.0 | 47.044 |
| 1563.0 | 47.058 |
| 1564.0 | 47.075 |
| 1565.0 | 47.105 |
| 1566.0 | 47.145 |
| 1567.0 | 47.189 |
| 1568.0 | 47.227 |
| 1569.0 | 47.261 |
| 1570.0 | 47.294 |
| 1571.0 | 47.325 |
| 1572.0 | 47.349 |
| 1573.0 | 47.362 |
| 1574.0 | 47.37 |
| 1575.0 | 47.385 |
| 1576.0 | 47.407 |
| 1577.0 | 47.438 |
| 1578.0 | 47.474 |
| 1579.0 | 47.506 |
| 1580.0 | 47.531 |
| 1581.0 | 47.546 |
| 1582.0 | 47.552 |
| 1583.0 | 47.557 |
| 1584.0 | 47.571 |
| 1585.0 | 47.595 |
| 1586.0 | 47.625 |
| 1587.0 | 47.651 |
| 1588.0 | 47.666 |
| 1589.0 | 47.675 |
| 1590.0 | 47.687 |
| 1591.0 | 47.702 |
| 1592.0 | 47.718 |
| 1593.0 | 47.731 |
| 1594.0 | 47.738 |
| 1595.0 | 47.746 |
| 1596.0 | 47.764 |
| 1597.0 | 47.79 |
| 1598.0 | 47.815 |
| 1599.0 | 47.835 |
| 1600.0 | 47.849 |
| 1601.0 | 47.857 |
| 1602.0 | 47.868 |
| 1603.0 | 47.889 |
| 1604.0 | 47.922 |
| 1605.0 | 47.961 |
| 1606.0 | 47.999 |
| 1607.0 | 48.029 |
| 1608.0 | 48.044 |
| 1609.0 | 48.05 |
| 1610.0 | 48.053 |
| 1611.0 | 48.06 |
| 1612.0 | 48.07 |
| 1613.0 | 48.078 |
| 1614.0 | 48.087 |
| 1615.0 | 48.096 |
| 1616.0 | 48.109 |
| 1617.0 | 48.126 |
| 1618.0 | 48.143 |
| 1619.0 | 48.158 |
| 1620.0 | 48.172 |
| 1621.0 | 48.185 |
| 1622.0 | 48.199 |
| 1623.0 | 48.214 |
| 1624.0 | 48.23 |
| 1625.0 | 48.24 |
| 1626.0 | 48.237 |
| 1627.0 | 48.223 |
| 1628.0 | 48.206 |
| 1629.0 | 48.195 |
| 1630.0 | 48.192 |
| 1631.0 | 48.203 |
| 1632.0 | 48.224 |
| 1633.0 | 48.251 |
| 1634.0 | 48.277 |
| 1635.0 | 48.299 |
| 1636.0 | 48.32 |
| 1637.0 | 48.342 |
| 1638.0 | 48.366 |
| 1639.0 | 48.39 |
| 1640.0 | 48.412 |
| 1641.0 | 48.431 |
| 1642.0 | 48.445 |
| 1643.0 | 48.456 |
| 1644.0 | 48.465 |
| 1645.0 | 48.473 |
| 1646.0 | 48.48 |
| 1647.0 | 48.487 |
| 1648.0 | 48.497 |
| 1649.0 | 48.513 |
| 1650.0 | 48.536 |
| 1651.0 | 48.561 |
| 1652.0 | 48.583 |
| 1653.0 | 48.6 |
| 1654.0 | 48.613 |
| 1655.0 | 48.622 |
| 1656.0 | 48.629 |
| 1657.0 | 48.638 |
| 1658.0 | 48.649 |
| 1659.0 | 48.659 |
| 1660.0 | 48.66 |
| 1661.0 | 48.654 |
| 1662.0 | 48.641 |
| 1663.0 | 48.63 |
| 1664.0 | 48.627 |
| 1665.0 | 48.631 |
| 1666.0 | 48.638 |
| 1667.0 | 48.646 |
| 1668.0 | 48.653 |
| 1669.0 | 48.661 |
| 1670.0 | 48.672 |
| 1671.0 | 48.689 |
| 1672.0 | 48.71 |
| 1673.0 | 48.73 |
| 1674.0 | 48.748 |
| 1675.0 | 48.762 |
| 1676.0 | 48.771 |
| 1677.0 | 48.773 |
| 1678.0 | 48.773 |
| 1679.0 | 48.772 |
| 1680.0 | 48.775 |
| 1681.0 | 48.783 |
| 1682.0 | 48.796 |
| 1683.0 | 48.813 |
| 1684.0 | 48.837 |
| 1685.0 | 48.866 |
| 1686.0 | 48.892 |
| 1687.0 | 48.91 |
| 1688.0 | 48.921 |
| 1689.0 | 48.932 |
| 1690.0 | 48.945 |
| 1691.0 | 48.959 |
| 1692.0 | 48.968 |
| 1693.0 | 48.966 |
| 1694.0 | 48.952 |
| 1695.0 | 48.931 |
| 1696.0 | 48.91 |
| 1697.0 | 48.892 |
| 1698.0 | 48.879 |
| 1699.0 | 48.872 |
| 1700.0 | 48.874 |
| 1701.0 | 48.882 |
| 1702.0 | 48.889 |
| 1703.0 | 48.888 |
| 1704.0 | 48.876 |
| 1705.0 | 48.859 |
| 1706.0 | 48.843 |
| 1707.0 | 48.827 |
| 1708.0 | 48.81 |
| 1709.0 | 48.796 |
| 1710.0 | 48.784 |
| 1711.0 | 48.774 |
| 1712.0 | 48.759 |
| 1713.0 | 48.74 |
| 1714.0 | 48.718 |
| 1715.0 | 48.704 |
| 1716.0 | 48.703 |
| 1717.0 | 48.714 |
| 1718.0 | 48.73 |
| 1719.0 | 48.746 |
| 1720.0 | 48.76 |
| 1721.0 | 48.772 |
| 1722.0 | 48.78 |
| 1723.0 | 48.78 |
| 1724.0 | 48.77 |
| 1725.0 | 48.752 |
| 1726.0 | 48.735 |
| 1727.0 | 48.722 |
| 1728.0 | 48.713 |
| 1729.0 | 48.709 |
| 1730.0 | 48.71 |
| 1731.0 | 48.715 |
| 1732.0 | 48.728 |
| 1733.0 | 48.746 |
| 1734.0 | 48.769 |
| 1735.0 | 48.793 |
| 1736.0 | 48.817 |
| 1737.0 | 48.837 |
| 1738.0 | 48.849 |
| 1739.0 | 48.849 |
| 1740.0 | 48.836 |
| 1741.0 | 48.819 |
| 1742.0 | 48.802 |
| 1743.0 | 48.785 |
| 1744.0 | 48.767 |
| 1745.0 | 48.75 |
| 1746.0 | 48.74 |
| 1747.0 | 48.743 |
| 1748.0 | 48.758 |
| 1749.0 | 48.781 |
| 1750.0 | 48.811 |
| 1751.0 | 48.845 |
| 1752.0 | 48.876 |
| 1753.0 | 48.898 |
| 1754.0 | 48.909 |
| 1755.0 | 48.906 |
| 1756.0 | 48.893 |
| 1757.0 | 48.876 |
| 1758.0 | 48.86 |
| 1759.0 | 48.847 |
| 1760.0 | 48.838 |
| 1761.0 | 48.832 |
| 1762.0 | 48.831 |
| 1763.0 | 48.836 |
| 1764.0 | 48.843 |
| 1765.0 | 48.852 |
| 1766.0 | 48.867 |
| 1767.0 | 48.889 |
| 1768.0 | 48.918 |
| 1769.0 | 48.947 |
| 1770.0 | 48.972 |
| 1771.0 | 48.992 |
| 1772.0 | 49.002 |
| 1773.0 | 48.998 |
| 1774.0 | 48.977 |
| 1775.0 | 48.947 |
| 1776.0 | 48.92 |
| 1777.0 | 48.903 |
| 1778.0 | 48.897 |
| 1779.0 | 48.897 |
| 1780.0 | 48.898 |
| 1781.0 | 48.899 |
| 1782.0 | 48.903 |
| 1783.0 | 48.914 |
| 1784.0 | 48.931 |
| 1785.0 | 48.952 |
| 1786.0 | 48.975 |
| 1787.0 | 49.002 |
| 1788.0 | 49.028 |
| 1789.0 | 49.048 |
| 1790.0 | 49.059 |
| 1791.0 | 49.061 |
| 1792.0 | 49.058 |
| 1793.0 | 49.051 |
| 1794.0 | 49.042 |
| 1795.0 | 49.043 |
| 1796.0 | 49.059 |
| 1797.0 | 49.092 |
| 1798.0 | 49.142 |
| 1799.0 | 49.195 |
| 1800.0 | 49.238 |
| 1801.0 | 49.276 |
| 1802.0 | 49.316 |
| 1803.0 | 49.36 |
| 1804.0 | 49.405 |
| 1805.0 | 49.443 |
| 1806.0 | 49.469 |
| 1807.0 | 49.486 |
| 1808.0 | 49.504 |
| 1809.0 | 49.526 |
| 1810.0 | 49.539 |
| 1811.0 | 49.544 |
| 1812.0 | 49.547 |
| 1813.0 | 49.556 |
| 1814.0 | 49.575 |
| 1815.0 | 49.606 |
| 1816.0 | 49.652 |
| 1817.0 | 49.705 |
| 1818.0 | 49.743 |
| 1819.0 | 49.755 |
| 1820.0 | 49.738 |
| 1821.0 | 49.711 |
| 1822.0 | 49.698 |
| 1823.0 | 49.71 |
| 1824.0 | 49.73 |
| 1825.0 | 49.739 |
| 1826.0 | 49.736 |
| 1827.0 | 49.732 |
| 1828.0 | 49.733 |
| 1829.0 | 49.741 |
| 1830.0 | 49.751 |
| 1831.0 | 49.761 |
| 1832.0 | 49.78 |
| 1833.0 | 49.815 |
| 1834.0 | 49.859 |
| 1835.0 | 49.899 |
| 1836.0 | 49.929 |
| 1837.0 | 49.943 |
| 1838.0 | 49.933 |
| 1839.0 | 49.887 |
| 1840.0 | 49.821 |
| 1841.0 | 49.776 |
| 1842.0 | 49.79 |
| 1843.0 | 49.871 |
| 1844.0 | 49.972 |
| 1845.0 | 50.029 |
| 1846.0 | 50.022 |
| 1847.0 | 49.978 |
| 1848.0 | 49.948 |
| 1849.0 | 49.956 |
| 1850.0 | 49.985 |
| 1851.0 | 50.022 |
| 1852.0 | 50.055 |
| 1853.0 | 50.084 |
| 1854.0 | 50.101 |
| 1855.0 | 50.093 |
| 1856.0 | 50.068 |
| 1857.0 | 50.047 |
| 1858.0 | 50.036 |
| 1859.0 | 50.031 |
| 1860.0 | 50.037 |
| 1861.0 | 50.068 |
| 1862.0 | 50.142 |
| 1863.0 | 50.252 |
| 1864.0 | 50.352 |
| 1865.0 | 50.392 |
| 1866.0 | 50.358 |
| 1867.0 | 50.285 |
| 1868.0 | 50.24 |
| 1869.0 | 50.261 |
| 1870.0 | 50.327 |
| 1871.0 | 50.378 |
| 1872.0 | 50.373 |
| 1873.0 | 50.327 |
| 1874.0 | 50.275 |
| 1875.0 | 50.237 |
| 1876.0 | 50.213 |
| 1877.0 | 50.203 |
| 1878.0 | 50.214 |
| 1879.0 | 50.24 |
| 1880.0 | 50.264 |
| 1881.0 | 50.291 |
| 1882.0 | 50.317 |
| 1883.0 | 50.333 |
| 1884.0 | 50.33 |
| 1885.0 | 50.304 |
| 1886.0 | 50.253 |
| 1887.0 | 50.2 |
| 1888.0 | 50.174 |
| 1889.0 | 50.175 |
| 1890.0 | 50.195 |
| 1891.0 | 50.211 |
| 1892.0 | 50.21 |
| 1893.0 | 50.218 |
| 1894.0 | 50.258 |
| 1895.0 | 50.338 |
| 1896.0 | 50.445 |
| 1897.0 | 50.538 |
| 1898.0 | 50.6 |
| 1899.0 | 50.643 |
| 1900.0 | 50.673 |
| 1901.0 | 50.697 |
| 1902.0 | 50.711 |
| 1903.0 | 50.72 |
| 1904.0 | 50.714 |
| 1905.0 | 50.704 |
| 1906.0 | 50.702 |
| 1907.0 | 50.717 |
| 1908.0 | 50.743 |
| 1909.0 | 50.784 |
| 1910.0 | 50.825 |
| 1911.0 | 50.849 |
| 1912.0 | 50.864 |
| 1913.0 | 50.884 |
| 1914.0 | 50.917 |
| 1915.0 | 50.963 |
| 1916.0 | 50.989 |
| 1917.0 | 50.976 |
| 1918.0 | 50.927 |
| 1919.0 | 50.855 |
| 1920.0 | 50.796 |
| 1921.0 | 50.771 |
| 1922.0 | 50.77 |
| 1923.0 | 50.778 |
| 1924.0 | 50.776 |
| 1925.0 | 50.768 |
| 1926.0 | 50.761 |
| 1927.0 | 50.772 |
| 1928.0 | 50.8 |
| 1929.0 | 50.831 |
| 1930.0 | 50.852 |
| 1931.0 | 50.855 |
| 1932.0 | 50.842 |
| 1933.0 | 50.824 |
| 1934.0 | 50.822 |
| 1935.0 | 50.84 |
| 1936.0 | 50.859 |
| 1937.0 | 50.866 |
| 1938.0 | 50.844 |
| 1939.0 | 50.807 |
| 1940.0 | 50.782 |
| 1941.0 | 50.79 |
| 1942.0 | 50.829 |
| 1943.0 | 50.88 |
| 1944.0 | 50.923 |
| 1945.0 | 50.955 |
| 1946.0 | 50.98 |
| 1947.0 | 51.006 |
| 1948.0 | 51.039 |
| 1949.0 | 51.08 |
| 1950.0 | 51.116 |
| 1951.0 | 51.143 |
| 1952.0 | 51.171 |
| 1953.0 | 51.198 |
| 1954.0 | 51.227 |
| 1955.0 | 51.26 |
| 1956.0 | 51.297 |
| 1957.0 | 51.333 |
| 1958.0 | 51.364 |
| 1959.0 | 51.394 |
| 1960.0 | 51.425 |
| 1961.0 | 51.471 |
| 1962.0 | 51.532 |
| 1963.0 | 51.594 |
| 1964.0 | 51.642 |
| 1965.0 | 51.671 |
| 1966.0 | 51.689 |
| 1967.0 | 51.704 |
| 1968.0 | 51.72 |
| 1969.0 | 51.743 |
| 1970.0 | 51.774 |
| 1971.0 | 51.805 |
| 1972.0 | 51.83 |
| 1973.0 | 51.849 |
| 1974.0 | 51.864 |
| 1975.0 | 51.879 |
| 1976.0 | 51.902 |
| 1977.0 | 51.937 |
| 1978.0 | 51.978 |
| 1979.0 | 52.022 |
| 1980.0 | 52.061 |
| 1981.0 | 52.092 |
| 1982.0 | 52.12 |
| 1983.0 | 52.143 |
| 1984.0 | 52.162 |
| 1985.0 | 52.174 |
| 1986.0 | 52.183 |
| 1987.0 | 52.197 |
| 1988.0 | 52.215 |
| 1989.0 | 52.23 |
| 1990.0 | 52.24 |
| 1991.0 | 52.247 |
| 1992.0 | 52.254 |
| 1993.0 | 52.261 |
| 1994.0 | 52.27 |
| 1995.0 | 52.282 |
| 1996.0 | 52.291 |
| 1997.0 | 52.295 |
| 1998.0 | 52.292 |
| 1999.0 | 52.283 |
| 2000.065834 | 52.391 |
| 2009.942668 | 52.683 |
| 2020.098566 | 52.72 |
| 2029.969298 | 52.955 |
| 2039.837 | 53.078 |
| 2049.98346 | 53.319 |
| 2059.844971 | 53.526 |
| 2069.985031 | 53.785 |
| 2079.840289 | 54 |
| 2089.973887 | 54.196 |
| 2099.822832 | 54.394 |
| 2109.949906 | 54.63 |
| 2119.792477 | 54.714 |
| 2129.912964 | 54.747 |
| 2140.030088 | 54.75 |
| 2149.862941 | 54.861 |
| 2159.973384 | 54.854 |
| 2169.799712 | 54.9 |
| 2179.903413 | 54.975 |
| 2190.003671 | 55.11 |
| 2199.820052 | 55.192 |
| 2209.913475 | 55.274 |
| 2219.723179 | 55.406 |
| 2229.809704 | 55.468 |
| 2239.892708 | 55.583 |
| 2249.692237 | 55.635 |
| 2259.76825 | 55.964 |
| 2269.840694 | 56.236 |
| 2279.909553 | 56.482 |
| 2289.695271 | 56.516 |
| 2299.757015 | 56.526 |
| 2309.815127 | 56.673 |
| 2319.869592 | 56.856 |
| 2329.641254 | 57.058 |
| 2339.688478 | 57.125 |
| 2349.732008 | 57.159 |
| 2359.771828 | 57.268 |
| 2369.80792 | 57.279 |
| 2379.840271 | 57.197 |
| 2389.590342 | 57.044 |
| 2399.615266 | 56.985 |
| 2409.6364 | 56.993 |
| 2419.65373 | 56.841 |
| 2429.667238 | 56.822 |
| 2439.676909 | 56.824 |
| 2449.682728 | 56.942 |
| 2459.684679 | 57.004 |
| 2469.682745 | 57.146 |
| 2479.676911 | 57.19 |
| 2489.667162 | 57.156 |
| 2499.653481 | 57.013 |
| 2509.635853 | 56.956 |
| 2519.614261 | 56.892 |
| 2529.588691 | 56.914 |
| 2539.559127 | 56.84 |
| 2549.525552 | 56.809 |
| 2559.487951 | 56.7 |
| 2569.722871 | 56.862 |
| 2579.677058 | 56.962 |
| 2589.627171 | 56.807 |
| 2599.573195 | 56.602 |
| 2609.515113 | 56.507 |
| 2619.452911 | 56.75 |
| 2629.662448 | 56.837 |
| 2639.591842 | 56.814 |
| 2649.517067 | 56.757 |
| 2659.438109 | 56.669 |
| 2669.630358 | 56.445 |
| 2679.542867 | 56.011 |
| 2689.451145 | 55.183 |
| 2699.630227 | 53.91 |
| 2709.529877 | 51.489 |
| 2719.425248 | 47.374 |
| 2729.591015 | 40.606 |
| 2739.477662 | 32.52 |
| 2749.359982 | 24.263 |
| 2759.512287 | 17.885 |
| 2769.385788 | 12.947 |
| 2779.528995 | 9.824 |
| 2789.393611 | 7.738 |
| 2799.527654 | 6.652 |
| 2809.383323 | 5.967 |
| 2819.508136 | 5.483 |
| 2829.354792 | 5.245 |
| 2839.47031 | 5.021 |
| 2849.30789 | 4.891 |
| 2859.414046 | 4.743 |
| 2869.515434 | 4.787 |
| 2879.339216 | 4.92 |
| 2889.431143 | 5.091 |
| 2899.24569 | 5.304 |
| 2909.328092 | 5.424 |
| 2919.40564 | 5.607 |
| 2929.206149 | 5.844 |
| 2939.274073 | 6.16 |
| 2949.337095 | 6.416 |
| 2959.395197 | 6.595 |
| 2969.17672 | 6.921 |
| 2979.225066 | 7.271 |
| 2989.268442 | 7.631 |
| 2999.306833 | 8.016 |
| 3009.34022 | 8.206 |
| 3019.368587 | 8.588 |
| 3029.391918 | 8.726 |
| 3039.139497 | 9.211 |
| 3049.152842 | 9.45 |
| 3059.1611 | 9.86 |
| 3069.164256 | 10.148 |
| 3079.162292 | 10.495 |
| 3089.155191 | 10.851 |
| 3099.142938 | 11.194 |
| 3109.125515 | 11.427 |
| 3119.102905 | 11.88 |
| 3129.075093 | 12.293 |
| 3139.311366 | 12.763 |
| 3149.272956 | 13.233 |
| 3159.229293 | 13.722 |
| 3169.18036 | 14.281 |
| 3179.126141 | 14.669 |
| 3189.066618 | 15.123 |
| 3199.27022 | 15.45 |
| 3209.199897 | 15.692 |
| 3219.124221 | 15.995 |
| 3229.043176 | 16.5 |
| 3239.224603 | 16.995 |
| 3249.132622 | 17.324 |
| 3259.035221 | 17.48 |
| 3269.199799 | 17.743 |
| 3279.091361 | 17.867 |
| 3288.977454 | 17.986 |
| 3299.125027 | 17.949 |
| 3308.999981 | 17.753 |
| 3319.136081 | 17.448 |
| 3328.999829 | 17.006 |
| 3339.124385 | 16.508 |
| 3348.976861 | 16.034 |
| 3359.089804 | 15.327 |
| 3368.930939 | 14.758 |
| 3379.0322 | 13.937 |
| 3389.127517 | 13.098 |
| 3398.951437 | 11.976 |
| 3409.034967 | 10.841 |
| 3419.112499 | 9.678 |
| 3428.919052 | 8.687 |
| 3438.984693 | 7.682 |
| 3449.044284 | 6.747 |
| 3458.833318 | 5.903 |
| 3468.880914 | 5.274 |
| 3478.922407 | 4.772 |
| 3488.957779 | 4.122 |
| 3498.987012 | 3.509 |
| 3509.010089 | 2.762 |
| 3519.026992 | 2.259 |
| 3529.037703 | 1.823 |
| 3538.779008 | 1.525 |
| 3548.777448 | 1.166 |
| 3558.769643 | 1.024 |
| 3568.755577 | 0.957 |
| 3578.997769 | 0.809 |
| 3588.970961 | 0.59 |
| 3598.937838 | 0.491 |
| 3608.898383 | 0.528 |
| 3618.852578 | 0.367 |
| 3628.800407 | 0.35 |
| 3638.74185 | 0.423 |
| 3648.938253 | 0.488 |
| 3658.866705 | 0.666 |
| 3668.788719 | 0.521 |
| 3678.704279 | 0.668 |
| 3688.874043 | 0.39 |
| 3698.776469 | 0.664 |
| 3708.672387 | 0.688 |
| 3718.821938 | 1.1 |
| 3728.704616 | 0.944 |
| 3738.840542 | 1.003 |
| 3748.709907 | 0.854 |
| 3758.832135 | 1.155 |
| 3768.688117 | 1.37 |
| 3778.796573 | 1.508 |
| 3788.639101 | 1.748 |
| 3798.733711 | 2.069 |
| 3808.821282 | 2.524 |
| 3818.643407 | 2.78 |
| 3828.717023 | 2.681 |
| 3838.783543 | 2.734 |
| 3848.585104 | 2.616 |
| 3858.637559 | 2.802 |
| 3868.682864 | 2.618 |
| 3878.720999 | 2.636 |
| 3888.751945 | 2.293 |
| 3898.518755 | 2.111 |
| 3908.535455 | 1.794 |
| 3918.54491 | 1.915 |
| 3928.547104 | 1.831 |
| 3938.542016 | 1.646 |
| 3948.52963 | 1.324 |
| 3958.509925 | 0.992 |
| 3968.482884 | 1.389 |
| 3978.70392 | 1.423 |
| 3988.661962 | 1.633 |
| 3998.612612 | 1.213 |
| 4008.555852 | 1.041 |
| 4018.491662 | 1.109 |
| 4028.6745 | 1.163 |
| 4038.595205 | 1.336 |
| 4048.508426 | 1.228 |
| 4058.414143 | 1.197 |
| 4068.56604 | 1.197 |
| 4078.456503 | 1.181 |
| 4088.592715 | 1.236 |
| 4098.467848 | 1.319 |
| 4108.588299 | 1.33 |
| 4118.448027 | 1.323 |
| 4128.552639 | 1.282 |
| 4138.396887 | 1.279 |
| 4148.485584 | 1.249 |
| 4158.566193 | 1.256 |
| 4168.386981 | 1.258 |
| 4178.45156 | 1.285 |
| 4188.507992 | 1.274 |
| 4198.305151 | 1.27 |
| 4208.345437 | 1.258 |
| 4218.377519 | 1.257 |
| 4228.401377 | 1.228 |
| 4238.416991 | 1.165 |
| 4248.424343 | 1.156 |
| 4258.423411 | 1.11 |
| 4268.414178 | 1.071 |
| 4278.396623 | 1.029 |
| 4288.370728 | 1.024 |
| 4298.336471 | 1.012 |
| 4308.293836 | 0.987 |
| 4318.2428 | 0.962 |
| 4328.431752 | 0.936 |
| 4338.363649 | 0.903 |
| 4348.287088 | 0.873 |
| 4358.20205 | 0.854 |
| 4368.356068 | 0.844 |
| 4378.253805 | 0.841 |
| 4388.390126 | 0.833 |
| 4398.270558 | 0.818 |
| 4408.389101 | 0.795 |
| 4418.252149 | 0.776 |
| 4428.352834 | 0.756 |
| 4438.198419 | 0.74 |
| 4448.281165 | 0.726 |
| 4458.354799 | 0.709 |
| 4468.173935 | 0.693 |
| 4478.229508 | 0.679 |
| 4488.275909 | 0.665 |
| 4498.313117 | 0.652 |
| 4508.096635 | 0.639 |
| 4518.115621 | 0.627 |
| 4528.125352 | 0.616 |
| 4538.125809 | 0.605 |
| 4548.11697 | 0.595 |
| 4558.098816 | 0.586 |
| 4568.071325 | 0.577 |
| 4578.277365 | 0.568 |
| 4588.230912 | 0.56 |
| 4598.175061 | 0.552 |
| 4608.109792 | 0.544 |
| 4618.035085 | 0.537 |
| 4628.192649 | 0.53 |
| 4638.098772 | 0.523 |
| 4647.995395 | 0.517 |
| 4658.123528 | 0.511 |
| 4668.000857 | 0.505 |
| 4678.109183 | 0.5 |
| 4687.967136 | 0.494 |
| 4698.05557 | 0.489 |
| 4708.133906 | 0.484 |
| 4717.962521 | 0.48 |
| 4728.020838 | 0.475 |
| 4738.068993 | 0.471 |
| 4748.106964 | 0.467 |
| 4758.13473 | 0.462 |
| 4767.913874 | 0.459 |
| 4777.921408 | 0.455 |
| 4787.918673 | 0.451 |
| 4797.905646 | 0.448 |
| 4807.882307 | 0.444 |
| 4818.085802 | 0.441 |
| 4828.041526 | 0.437 |
| 4837.986874 | 0.434 |
| 4847.921823 | 0.431 |
| 4857.846351 | 0.428 |
| 4867.996361 | 0.425 |
| 4877.899737 | 0.422 |
| 4888.028045 | 0.419 |
| 4897.910179 | 0.417 |
| 4908.016697 | 0.414 |
| 4917.877504 | 0.411 |
| 4927.962141 | 0.409 |
| 4937.801534 | 0.406 |
| 4947.864203 | 0.404 |
| 4957.915724 | 0.402 |
| 4967.956075 | 0.399 |
| 4977.985234 | 0.397 |
| 4987.77033 | 0.395 |
| 4997.777298 | 0.392 |
| 5007.776688 | 0.39 |
| 5017.595804 | 0.388 |
| 5028.169082 | 0.386 |
| 5037.98605 | 0.384 |
| 5047.80198 | 0.382 |
| 5057.616872 | 0.38 |
| 5068.18559 | 0.378 |
| 5077.998316 | 0.376 |
| 5087.809996 | 0.374 |
| 5097.620628 | 0.373 |
| 5107.430211 | 0.371 |
| 5117.993201 | 0.369 |
| 5127.800597 | 0.367 |
| 5137.606938 | 0.366 |
| 5147.41222 | 0.364 |
| 5157.970569 | 0.362 |
| 5167.773648 | 0.361 |
| 5177.575662 | 0.359 |
| 5187.376611 | 0.358 |
| 5197.930283 | 0.356 |
| 5207.729011 | 0.354 |
| 5217.526666 | 0.353 |
| 5227.323247 | 0.351 |
| 5237.872207 | 0.35 |
| 5247.666549 | 0.349 |
| 5257.459812 | 0.347 |
| 5268.005191 | 0.346 |
| 5277.796202 | 0.344 |
| 5287.586127 | 0.343 |
| 5297.374963 | 0.342 |
| 5307.915566 | 0.34 |
| 5317.702134 | 0.339 |
| 5327.487607 | 0.338 |
| 5337.271982 | 0.337 |
| 5347.807773 | 0.335 |
| 5357.589864 | 0.334 |
| 5367.370852 | 0.333 |
| 5377.902987 | 0.332 |
| 5387.681677 | 0.33 |
| 5397.459258 | 0.329 |
| 5407.235727 | 0.328 |
| 5417.762987 | 0.327 |
| 5427.537141 | 0.326 |
| 5437.310177 | 0.325 |
| 5447.833734 | 0.324 |
| 5457.604442 | 0.323 |
| 5467.374028 | 0.322 |
| 5477.142487 | 0.321 |
| 5487.661104 | 0.319 |
| 5497.427219 | 0.318 |
| 5507.192201 | 0.317 |
| 5517.707068 | 0.316 |
| 5527.469693 | 0.315 |
| 5537.231179 | 0.314 |
| 5547.742274 | 0.313 |
| 5557.50139 | 0.313 |
| 5567.259362 | 0.312 |
| 5577.766665 | 0.311 |
| 5587.522253 | 0.31 |
| 5597.276691 | 0.309 |
| 5607.780182 | 0.308 |
| 5617.532223 | 0.307 |
| 5627.283108 | 0.306 |
| 5637.032835 | 0.305 |
| 5647.531242 | 0.304 |
| 5657.278555 | 0.304 |
| 5667.024703 | 0.303 |
| 5677.51925 | 0.302 |
| 5687.262972 | 0.301 |
| 5697.005523 | 0.3 |
| 5707.496189 | 0.299 |
| 5717.236302 | 0.299 |
| 5726.975237 | 0.298 |
| 5737.462002 | 0.297 |
| 5747.198485 | 0.296 |
| 5757.682605 | 0.296 |
| 5767.416629 | 0.295 |
| 5777.149464 | 0.294 |
| 5787.629649 | 0.293 |
| 5797.360012 | 0.293 |
| 5807.08918 | 0.292 |
| 5817.565409 | 0.291 |
| 5827.292092 | 0.29 |
| 5837.017575 | 0.29 |
| 5847.489828 | 0.289 |
| 5857.212813 | 0.288 |
| 5866.934591 | 0.288 |
| 5877.402847 | 0.287 |
| 5887.122114 | 0.286 |
| 5897.587661 | 0.286 |
| 5907.304408 | 0.285 |
| 5917.019938 | 0.285 |
| 5927.481454 | 0.284 |
| 5937.194452 | 0.283 |
| 5946.906226 | 0.283 |
| 5957.363691 | 0.282 |
| 5967.072921 | 0.281 |
| 5977.52764 | 0.281 |
| 5987.234315 | 0.28 |
| 5996.939757 | 0.28 |
| 6007.39039 | 0.279 |
| 6017.093265 | 0.279 |
| 6026.794901 | 0.278 |
| 6037.241429 | 0.277 |
| 6046.940485 | 0.277 |
| 6057.38423 | 0.276 |
| 6067.080698 | 0.276 |
| 6076.775917 | 0.275 |
| 6087.215522 | 0.275 |
| 6096.908139 | 0.274 |
| 6107.344938 | 0.274 |
| 6117.034946 | 0.273 |
| 6126.723694 | 0.273 |
| 6137.156319 | 0.272 |
| 6146.842444 | 0.272 |
| 6157.272241 | 0.271 |
| 6166.955735 | 0.271 |
| 6177.382693 | 0.27 |
| 6187.063548 | 0.27 |
| 6196.743128 | 0.269 |
| 6207.165865 | 0.269 |
| 6216.842793 | 0.268 |
| 6227.262668 | 0.268 |
| 6236.936935 | 0.267 |
| 6246.609918 | 0.267 |
| 6257.025537 | 0.266 |
| 6266.695846 | 0.266 |
| 6277.108582 | 0.266 |
| 6286.776208 | 0.265 |
| 6297.18605 | 0.265 |
| 6306.850986 | 0.264 |
| 6317.257926 | 0.264 |
| 6326.920162 | 0.263 |
| 6336.581095 | 0.263 |
| 6346.983717 | 0.263 |
| 6356.641938 | 0.262 |
| 6367.041635 | 0.262 |
| 6376.697135 | 0.261 |
| 6387.093897 | 0.261 |
| 6396.746668 | 0.261 |
| 6407.140486 | 0.26 |
| 6416.790518 | 0.26 |
| 6427.181383 | 0.259 |
| 6436.828669 | 0.259 |
| 6446.47463 | 0.259 |
| 6456.861103 | 0.258 |
| 6466.504304 | 0.258 |
| 6476.8878 | 0.258 |
| 6486.528234 | 0.257 |
| 6496.908745 | 0.257 |
| 6506.546402 | 0.257 |
| 6516.923919 | 0.256 |
| 6526.558791 | 0.256 |
| 6536.933304 | 0.256 |
| 6546.565382 | 0.255 |
| 6556.936882 | 0.255 |
| 6566.566159 | 0.255 |
| 6576.934637 | 0.254 |
| 6586.561102 | 0.254 |
| 6596.926549 | 0.254 |
| 6606.550195 | 0.253 |
| 6616.912601 | 0.253 |
| 6626.53342 | 0.253 |
| 6636.892776 | 0.252 |
| 6646.510758 | 0.252 |
| 6656.867055 | 0.252 |
| 6666.482193 | 0.251 |
| 6676.835422 | 0.251 |
| 6686.447706 | 0.251 |
| 6696.797857 | 0.25 |
| 6706.40728 | 0.25 |
| 6716.754344 | 0.25 |
| 6726.360896 | 0.25 |
| 6736.704865 | 0.249 |
| 6746.308538 | 0.249 |
| 6756.649402 | 0.249 |
| 6766.250188 | 0.248 |
| 6776.587937 | 0.248 |
| 6786.924068 | 0.248 |
| 6796.520453 | 0.248 |
| 6806.853456 | 0.247 |
| 6816.446931 | 0.247 |
| 6826.776797 | 0.247 |
| 6836.367355 | 0.247 |
| 6846.694074 | 0.246 |
| 6856.281707 | 0.246 |
| 6866.60527 | 0.246 |
| 6876.189968 | 0.246 |
| 6886.510366 | 0.245 |
| 6896.82912 | 0.245 |
| 6906.409345 | 0.245 |
| 6916.724921 | 0.245 |
| 6926.30219 | 0.244 |
| 6936.614577 | 0.244 |
| 6946.188882 | 0.244 |
| 6956.498072 | 0.244 |
| 6966.805601 | 0.243 |
| 6976.375388 | 0.243 |
| 6986.679706 | 0.243 |
| 6996.246507 | 0.243 |
| 7006.547605 | 0.242 |
| 7016.111412 | 0.242 |
| 7026.40928 | 0.242 |
| 7036.70547 | 0.242 |
| 7046.264714 | 0.242 |
| 7056.557661 | 0.241 |
| 7066.113889 | 0.241 |
| 7076.403584 | 0.241 |
| 7086.691589 | 0.241 |
| 7096.243221 | 0.24 |
| 7106.527959 | 0.24 |
| 7116.076554 | 0.24 |
| 7126.358018 | 0.24 |
| 7136.637779 | 0.24 |
| 7146.181746 | 0.239 |
| 7156.458218 | 0.239 |
| 7165.999126 | 0.239 |
| 7176.2723 | 0.239 |
| 7186.54376 | 0.239 |
| 7196.080008 | 0.238 |
| 7206.348156 | 0.238 |
| 7216.614582 | 0.238 |
| 7226.14615 | 0.238 |
| 7236.409251 | 0.238 |
| 7245.937725 | 0.237 |
| 7256.197491 | 0.237 |
| 7266.455524 | 0.237 |
| 7275.979286 | 0.237 |
| 7286.23397 | 0.237 |
| 7296.486914 | 0.237 |
| 7306.005944 | 0.236 |
| 7316.255525 | 0.236 |
| 7326.503358 | 0.236 |
| 7336.017637 | 0.236 |
| 7346.262094 | 0.236 |
| 7356.504797 | 0.236 |
| 7366.014304 | 0.235 |
| 7376.253616 | 0.235 |
| 7386.491167 | 0.235 |
| 7395.995884 | 0.235 |
| 7406.23003 | 0.235 |
| 7416.462408 | 0.235 |
| 7425.962315 | 0.234 |
| 7436.191274 | 0.234 |
| 7446.418458 | 0.234 |
| 7455.913536 | 0.234 |
| 7466.137287 | 0.234 |
| 7476.359256 | 0.234 |
| 7485.849485 | 0.233 |
| 7496.068008 | 0.233 |
| 7506.284741 | 0.233 |
| 7515.770101 | 0.233 |
| 7525.983375 | 0.233 |
| 7536.19485 | 0.233 |
| 7545.675324 | 0.232 |
| 7555.883326 | 0.232 |
| 7566.089524 | 0.232 |
| 7576.293916 | 0.232 |
| 7585.767802 | 0.232 |
| 7595.968701 | 0.232 |
| 7606.167786 | 0.232 |
| 7615.636739 | 0.231 |
| 7625.832319 | 0.231 |
| 7636.026078 | 0.231 |
| 7646.218013 | 0.231 |
| 7655.680318 | 0.231 |
| 7665.868729 | 0.231 |
| 7676.05531 | 0.231 |
| 7686.240057 | 0.23 |
| 7695.695679 | 0.23 |
| 7705.876884 | 0.23 |
| 7716.056248 | 0.23 |
| 7726.23377 | 0.23 |
| 7735.682674 | 0.23 |
| 7745.856636 | 0.23 |
| 7756.028747 | 0.23 |
| 7766.199006 | 0.229 |
| 7775.641157 | 0.229 |
| 7785.807837 | 0.229 |
| 7795.972657 | 0.229 |
| 7806.135616 | 0.229 |
| 7815.57098 | 0.229 |
| 7825.730341 | 0.229 |
| 7835.887833 | 0.228 |
| 7846.043454 | 0.228 |
| 7855.471995 | 0.228 |
| 7865.624 | 0.228 |
| 7875.774127 | 0.228 |
| 7885.922372 | 0.228 |
| 7896.068734 | 0.228 |
| 7905.488668 | 0.228 |
| 7915.631391 | 0.228 |
| 7925.772224 | 0.227 |
| 7935.911164 | 0.227 |
| 7946.048209 | 0.227 |
| 7955.45948 | 0.227 |
| 7965.592863 | 0.227 |
| 7975.724343 | 0.227 |
| 7985.853919 | 0.227 |
| 7995.981587 | 0.227 |
| 8005.384141 | 0.226 |
| 8015.508125 | 0.226 |
| 8025.630194 | 0.226 |
| 8035.750346 | 0.226 |
| 8045.86858 | 0.226 |
| 8055.984892 | 0.226 |
| 8065.376887 | 0.226 |
| 8075.489487 | 0.226 |
| 8085.600158 | 0.226 |
| 8095.708897 | 0.225 |
| 8105.815704 | 0.225 |
| 8115.920574 | 0.225 |
| 8125.301933 | 0.225 |
| 8135.403063 | 0.225 |
| 8145.502251 | 0.225 |
| 8155.599493 | 0.225 |
| 8165.694787 | 0.225 |
| 8175.788131 | 0.225 |
| 8185.879523 | 0.225 |
| 8195.248351 | 0.224 |
| 8205.33597 | 0.224 |
| 8215.42163 | 0.224 |
| 8225.505327 | 0.224 |
| 8235.587061 | 0.224 |
| 8245.666827 | 0.224 |
| 8255.744624 | 0.224 |
| 8265.82045 | 0.224 |
| 8275.174806 | 0.224 |
| 8285.246822 | 0.224 |
| 8295.31686 | 0.223 |
| 8305.384917 | 0.223 |
| 8315.45099 | 0.223 |
| 8325.515077 | 0.223 |
| 8335.577176 | 0.223 |
| 8345.637284 | 0.223 |
| 8355.695399 | 0.223 |
| 8365.751519 | 0.223 |
| 8375.087555 | 0.223 |
| 8385.139819 | 0.223 |
| 8395.190081 | 0.223 |
| 8405.238338 | 0.222 |
| 8415.284587 | 0.222 |
| 8425.328827 | 0.222 |
| 8435.371055 | 0.222 |
| 8445.411268 | 0.222 |
| 8455.449464 | 0.222 |
| 8465.485641 | 0.222 |
| 8475.519796 | 0.222 |
| 8485.551927 | 0.222 |
| 8495.582031 | 0.222 |
| 8505.610107 | 0.222 |
| 8515.636151 | 0.221 |
| 8525.660162 | 0.221 |
| 8535.682136 | 0.221 |
| 8544.98643 | 0.221 |
| 8555.004471 | 0.221 |
| 8565.020468 | 0.221 |
| 8575.034421 | 0.221 |
| 8585.046325 | 0.221 |
| 8595.056179 | 0.221 |
| 8605.063981 | 0.221 |
| 8615.069727 | 0.221 |
| 8625.073416 | 0.221 |
| 8635.075045 | 0.22 |
| 8645.074612 | 0.22 |
| 8655.072114 | 0.22 |
| 8665.067549 | 0.22 |
| 8675.060915 | 0.22 |
| 8685.052209 | 0.22 |
| 8695.041429 | 0.22 |
| 8705.028573 | 0.22 |
| 8715.013637 | 0.22 |
| 8724.99662 | 0.22 |
| 8734.977519 | 0.22 |
| 8744.956333 | 0.22 |
| 8754.933058 | 0.22 |
| 8764.907692 | 0.219 |
| 8774.880232 | 0.219 |
| 8784.850677 | 0.219 |
| 8794.819025 | 0.219 |
| 8804.785271 | 0.219 |
| 8815.461059 | 0.219 |
| 8825.422948 | 0.219 |
| 8835.382728 | 0.219 |
| 8845.340399 | 0.219 |
| 8855.295957 | 0.219 |
| 8865.249401 | 0.219 |
| 8875.200727 | 0.219 |
| 8885.149933 | 0.219 |
| 8895.097018 | 0.218 |
| 8905.041978 | 0.218 |
| 8914.984812 | 0.218 |
| 8924.925517 | 0.218 |
| 8934.86409 | 0.218 |
| 8944.800529 | 0.218 |
| 8954.734832 | 0.218 |
| 8965.376355 | 0.218 |
| 8975.306225 | 0.218 |
| 8985.233952 | 0.218 |
| 8995.159534 | 0.218 |
| 9005.082967 | 0.218 |
| 9015.004249 | 0.218 |
| 9024.923378 | 0.218 |
| 9034.840353 | 0.218 |
| 9044.755169 | 0.217 |
| 9054.667825 | 0.217 |
| 9065.286129 | 0.217 |
| 9075.194303 | 0.217 |
| 9085.10031 | 0.217 |
| 9095.004147 | 0.217 |
| 9104.905813 | 0.217 |
| 9114.805303 | 0.217 |
| 9124.702617 | 0.217 |
| 9134.597752 | 0.217 |
| 9145.197262 | 0.217 |
| 9155.087875 | 0.217 |
| 9164.976302 | 0.217 |
| 9174.86254 | 0.217 |
| 9184.746587 | 0.217 |
| 9194.628441 | 0.216 |
| 9204.508098 | 0.216 |
| 9215.091006 | 0.216 |
| 9224.966108 | 0.216 |
| 9234.839006 | 0.216 |
| 9244.709699 | 0.216 |
| 9254.578185 | 0.216 |
| 9265.149109 | 0.216 |
| 9275.013013 | 0.216 |
| 9284.874702 | 0.216 |
| 9294.734174 | 0.216 |
| 9304.591426 | 0.216 |
| 9314.446456 | 0.216 |
| 9325.002949 | 0.216 |
| 9334.853368 | 0.216 |
| 9344.701558 | 0.216 |
| 9354.547517 | 0.216 |
| 9364.391241 | 0.215 |
| 9374.935607 | 0.215 |
| 9384.774696 | 0.215 |
| 9394.611544 | 0.215 |
| 9404.446148 | 0.215 |
| 9414.980732 | 0.215 |
| 9424.810682 | 0.215 |
| 9434.63838 | 0.215 |
| 9444.463825 | 0.215 |
| 9454.988585 | 0.215 |
| 9464.809356 | 0.215 |
| 9474.627866 | 0.215 |
| 9484.444114 | 0.215 |
| 9494.959008 | 0.215 |
| 9504.770561 | 0.215 |
| 9514.579844 | 0.215 |
| 9524.386855 | 0.215 |
| 9534.891842 | 0.214 |
| 9544.694139 | 0.214 |
| 9554.494156 | 0.214 |
| 9564.291891 | 0.214 |
| 9574.786929 | 0.214 |
| 9584.57993 | 0.214 |
| 9594.370643 | 0.214 |
| 9604.858149 | 0.214 |
| 9614.644112 | 0.214 |
| 9624.427779 | 0.214 |
| 9634.209147 | 0.214 |
| 9644.686632 | 0.214 |
| 9654.463232 | 0.214 |
| 9664.237526 | 0.214 |
| 9674.707423 | 0.214 |
| 9684.476934 | 0.214 |
| 9694.244132 | 0.214 |
| 9704.706417 | 0.214 |
| 9714.468817 | 0.214 |
| 9724.228897 | 0.213 |
| 9734.683548 | 0.213 |
| 9744.438814 | 0.213 |
| 9754.191753 | 0.213 |
| 9764.638746 | 0.213 |
| 9774.386857 | 0.213 |
| 9784.132634 | 0.213 |
| 9794.571945 | 0.213 |
| 9804.312879 | 0.213 |
| 9814.746996 | 0.213 |
| 9824.483078 | 0.213 |
| 9834.216813 | 0.213 |
| 9844.643209 | 0.213 |
| 9854.372076 | 0.213 |
| 9864.09859 | 0.213 |
| 9874.517241 | 0.213 |
| 9884.238873 | 0.213 |
| 9894.652288 | 0.213 |
| 9904.369027 | 0.213 |
| 9914.083402 | 0.213 |
| 9924.489032 | 0.212 |
| 9934.198499 | 0.212 |
| 9944.598867 | 0.212 |
| 9954.303417 | 0.212 |
| 9964.00559 | 0.212 |
| 9974.398135 | 0.212 |
| 9984.095376 | 0.212 |
| 9994.482631 | 0.212 |
| 10004.17493 | 0.212 |
| 10014.55689 | 0.212 |
| 10024.24423 | 0.212 |
| 10033.92919 | 0.212 |
| 10044.30326 | 0.212 |
| 10053.98325 | 0.212 |
| 10064.352 | 0.212 |
| 10074.02701 | 0.212 |
| 10084.39043 | 0.212 |
| 10094.06045 | 0.212 |
| 10104.41852 | 0.212 |
| 10114.08355 | 0.212 |
| 10124.43625 | 0.212 |
| 10134.09628 | 0.212 |
| 10144.44362 | 0.211 |
| 10154.09862 | 0.211 |
| 10164.44058 | 0.211 |
| 10174.09056 | 0.211 |
| 10184.42713 | 0.211 |
| 10194.07208 | 0.211 |
| 10204.40325 | 0.211 |
| 10214.04315 | 0.211 |
| 10224.36891 | 0.211 |
| 10234.00375 | 0.211 |
| 10244.32409 | 0.211 |
| 10253.95386 | 0.211 |
| 10264.26877 | 0.211 |
| 10273.89347 | 0.211 |
| 10284.20293 | 0.211 |
| 10293.82255 | 0.211 |
| 10304.12656 | 0.211 |
| 10313.74108 | 0.211 |
| 10324.03963 | 0.211 |
| 10334.33534 | 0.211 |
| 10343.94211 | 0.211 |
| 10354.23234 | 0.211 |
| 10363.834 | 0.211 |
| 10374.11874 | 0.21 |
| 10383.71527 | 0.21 |
| 10393.99451 | 0.21 |
| 10404.2709 | 0.21 |
| 10413.85962 | 0.21 |
| 10424.1305 | 0.21 |
| 10433.71407 | 0.21 |
| 10443.97941 | 0.21 |
| 10454.2419 | 0.21 |
| 10463.81763 | 0.21 |
| 10474.07457 | 0.21 |
| 10483.64512 | 0.21 |
| 10493.8965 | 0.21 |
| 10504.14501 | 0.21 |
| 10513.70769 | 0.21 |
| 10523.95063 | 0.21 |
| 10534.19068 | 0.21 |
| 10543.74545 | 0.21 |
| 10553.97992 | 0.21 |
| 10564.21149 | 0.21 |
| 10573.75835 | 0.21 |
| 10583.98432 | 0.21 |
| 10593.52594 | 0.21 |
| 10603.7463 | 0.21 |
| 10613.96375 | 0.21 |
| 10624.17829 | 0.21 |
| 10633.70924 | 0.209 |
| 10643.91815 | 0.209 |
| 10654.12414 | 0.209 |
| 10663.64709 | 0.209 |
| 10673.84743 | 0.209 |
| 10684.04485 | 0.209 |
| 10693.55979 | 0.209 |
| 10703.75154 | 0.209 |
| 10713.94035 | 0.209 |
| 10723.44726 | 0.209 |
| 10733.6304 | 0.209 |
| 10743.81059 | 0.209 |
| 10753.98783 | 0.209 |
| 10763.48393 | 0.209 |
| 10773.65548 | 0.209 |
| 10783.82407 | 0.209 |
| 10793.9897 | 0.209 |
| 10803.47495 | 0.209 |
| 10813.63486 | 0.209 |
| 10823.7918 | 0.209 |
| 10833.94578 | 0.209 |
| 10843.42014 | 0.209 |
| 10853.56838 | 0.209 |
| 10863.71363 | 0.209 |
| 10873.85591 | 0.209 |
| 10883.31935 | 0.209 |
| 10893.45586 | 0.209 |
| 10903.58938 | 0.208 |
| 10913.71992 | 0.208 |
| 10923.84746 | 0.208 |
| 10933.29714 | 0.208 |
| 10943.41889 | 0.208 |
| 10953.53764 | 0.208 |
| 10963.65339 | 0.208 |
| 10973.76613 | 0.208 |
| 10983.87586 | 0.208 |
| 10993.3089 | 0.208 |
| 11003.41281 | 0.208 |
| 11013.5137 | 0.208 |
| 11023.61157 | 0.208 |
| 11033.70642 | 0.208 |
| 11043.79825 | 0.208 |
| 11053.21456 | 0.208 |
| 11063.30053 | 0.208 |
| 11073.38346 | 0.208 |
| 11083.46337 | 0.208 |
| 11093.54023 | 0.208 |
| 11103.61405 | 0.208 |
| 11113.68483 | 0.208 |
| 11123.75256 | 0.208 |
| 11133.14635 | 0.208 |
| 11143.20819 | 0.208 |
| 11153.26696 | 0.208 |
| 11163.32268 | 0.208 |
| 11173.37534 | 0.208 |
| 11183.42494 | 0.208 |
| 11193.47147 | 0.208 |
| 11203.51493 | 0.208 |
| 11213.55532 | 0.207 |
| 11223.59263 | 0.207 |
| 11233.62687 | 0.207 |
| 11243.65803 | 0.207 |
| 11253.6861 | 0.207 |
| 11263.71109 | 0.207 |
| 11273.06496 | 0.207 |
| 11283.08398 | 0.207 |
| 11293.09991 | 0.207 |
| 11303.11274 | 0.207 |
| 11313.12247 | 0.207 |
| 11323.12909 | 0.207 |
| 11333.13262 | 0.207 |
| 11343.13303 | 0.207 |
| 11353.13034 | 0.207 |
| 11363.12453 | 0.207 |
| 11373.11561 | 0.207 |
| 11383.10358 | 0.207 |
| 11393.08842 | 0.207 |
| 11403.07013 | 0.207 |
| 11413.04872 | 0.207 |
| 11423.02418 | 0.207 |
| 11432.99651 | 0.207 |
| 11442.96571 | 0.207 |
| 11452.93177 | 0.207 |
| 11463.55877 | 0.207 |
| 11473.51834 | 0.207 |
| 11483.47476 | 0.207 |
| 11493.42803 | 0.207 |
| 11503.37815 | 0.207 |
| 11513.32512 | 0.207 |
| 11523.26893 | 0.207 |
| 11533.20958 | 0.207 |
| 11543.14707 | 0.207 |
| 11553.0814 | 0.206 |
| 11563.01256 | 0.206 |
| 11572.94055 | 0.206 |
| 11582.86536 | 0.206 |
| 11593.44833 | 0.206 |
| 11603.36658 | 0.206 |
| 11613.28165 | 0.206 |
| 11623.19353 | 0.206 |
| 11633.10223 | 0.206 |
| 11643.00774 | 0.206 |
| 11652.91006 | 0.206 |
| 11662.80918 | 0.206 |
| 11673.36472 | 0.206 |
| 11683.25723 | 0.206 |
| 11693.14654 | 0.206 |
| 11703.03264 | 0.206 |
| 11712.91554 | 0.206 |
| 11722.79522 | 0.206 |
| 11733.33001 | 0.206 |
| 11743.20304 | 0.206 |
| 11753.07286 | 0.206 |
| 11762.93946 | 0.206 |
| 11772.80283 | 0.206 |
| 11783.3202 | 0.206 |
| 11793.1769 | 0.206 |
| 11803.03036 | 0.206 |
| 11812.88059 | 0.206 |
| 11822.72758 | 0.206 |
| 11833.22747 | 0.206 |
| 11843.06776 | 0.206 |
| 11852.9048 | 0.206 |
| 11862.73859 | 0.206 |
| 11873.22439 | 0.206 |
| 11883.05145 | 0.206 |
| 11892.87526 | 0.206 |
| 11902.69581 | 0.206 |
| 11913.16747 | 0.206 |
| 11922.98127 | 0.205 |
| 11932.79181 | 0.205 |
| 11942.59907 | 0.205 |
| 11953.05654 | 0.205 |
| 11962.85704 | 0.205 |
| 11972.65425 | 0.205 |
| 11983.10099 | 0.205 |
| 11992.89142 | 0.205 |
| 12002.67856 | 0.205 |
| 12013.11455 | 0.205 |
| 12022.89488 | 0.205 |
| 12032.67192 | 0.205 |
| 12043.09713 | 0.205 |
| 12052.86735 | 0.205 |
| 12062.63426 | 0.205 |
| 12073.04866 | 0.205 |
| 12082.80874 | 0.205 |
| 12092.5655 | 0.205 |
| 12102.96906 | 0.205 |
| 12112.71897 | 0.205 |
| 12122.46556 | 0.205 |
| 12132.85826 | 0.205 |
| 12142.59798 | 0.205 |
| 12152.98334 | 0.205 |
| 12162.71618 | 0.205 |
| 12172.44568 | 0.205 |
| 12182.82013 | 0.205 |
| 12192.54273 | 0.205 |
| 12202.90982 | 0.205 |
| 12212.62551 | 0.205 |
| 12222.98523 | 0.205 |
| 12232.69399 | 0.205 |
| 12242.39941 | 0.205 |
| 12252.74815 | 0.205 |
| 12262.44662 | 0.205 |
| 12272.78796 | 0.205 |
| 12282.47948 | 0.205 |
| 12292.81339 | 0.205 |
| 12302.49796 | 0.205 |
| 12312.82444 | 0.205 |
| 12322.50203 | 0.205 |
| 12332.82106 | 0.205 |
| 12342.49167 | 0.204 |
| 12352.80325 | 0.204 |
| 12362.46686 | 0.204 |
| 12372.77097 | 0.204 |
| 12382.42757 | 0.204 |
| 12392.7242 | 0.204 |
| 12402.37378 | 0.204 |
| 12412.66292 | 0.204 |
| 12422.30547 | 0.204 |
| 12432.58711 | 0.204 |
| 12442.22262 | 0.204 |
| 12452.49673 | 0.204 |
| 12462.76697 | 0.204 |
| 12472.39178 | 0.204 |
| 12482.65448 | 0.204 |
| 12492.27222 | 0.204 |
| 12502.52738 | 0.204 |
| 12512.77863 | 0.204 |
| 12522.38563 | 0.204 |
| 12532.62932 | 0.204 |
| 12542.22922 | 0.204 |
| 12552.46533 | 0.204 |
| 12562.69753 | 0.204 |
| 12572.28665 | 0.204 |
| 12582.51125 | 0.204 |
| 12592.73192 | 0.204 |
| 12602.31024 | 0.204 |
| 12612.5233 | 0.204 |
| 12622.09447 | 0.204 |
| 12632.29991 | 0.204 |
| 12642.5014 | 0.204 |
| 12652.69895 | 0.204 |
| 12662.25557 | 0.204 |
| 12672.44547 | 0.204 |
| 12682.63142 | 0.204 |
| 12692.17715 | 0.204 |
| 12702.35544 | 0.204 |
| 12712.52975 | 0.204 |
| 12722.06458 | 0.204 |
| 12732.23121 | 0.204 |
| 12742.39387 | 0.204 |
| 12752.55256 | 0.204 |
| 12762.07271 | 0.204 |
| 12772.22369 | 0.204 |
| 12782.37068 | 0.204 |
| 12792.51369 | 0.204 |
| 12802.01913 | 0.204 |
| 12812.1544 | 0.204 |
| 12822.28568 | 0.203 |
| 12832.41295 | 0.203 |
| 12842.53622 | 0.203 |
| 12852.02315 | 0.203 |
| 12862.13866 | 0.203 |
| 12872.25016 | 0.203 |
| 12882.35764 | 0.203 |
| 12892.4611 | 0.203 |
| 12901.92944 | 0.203 |
| 12912.02511 | 0.203 |
| 12922.11675 | 0.203 |
| 12932.20436 | 0.203 |
| 12942.28794 | 0.203 |
| 12952.36747 | 0.203 |
| 12962.44297 | 0.203 |
| 12971.88508 | 0.203 |
| 12981.95274 | 0.203 |
| 12992.01635 | 0.203 |
| 13002.07591 | 0.203 |
| 13012.13141 | 0.203 |
| 13022.18286 | 0.203 |
| 13032.23024 | 0.203 |
| 13042.27356 | 0.203 |
| 13052.31281 | 0.203 |
| 13062.34799 | 0.203 |
| 13072.37909 | 0.203 |
| 13081.77955 | 0.203 |
| 13091.80275 | 0.203 |
| 13101.82186 | 0.203 |
| 13111.83689 | 0.203 |
| 13121.84783 | 0.203 |
| 13131.85468 | 0.203 |
| 13141.85743 | 0.203 |
| 13151.85608 | 0.203 |
| 13161.85063 | 0.203 |
| 13171.84107 | 0.203 |
| 13181.8274 | 0.203 |
| 13191.80963 | 0.203 |
| 13201.78774 | 0.203 |
| 13211.76172 | 0.203 |
| 13221.73159 | 0.203 |
| 13231.69734 | 0.203 |
| 13241.65895 | 0.203 |
| 13252.23865 | 0.203 |
| 13262.19174 | 0.203 |
| 13272.1407 | 0.203 |
| 13282.08552 | 0.203 |
| 13292.02619 | 0.203 |
| 13301.96272 | 0.203 |
| 13311.8951 | 0.203 |
| 13321.82333 | 0.203 |
| 13331.7474 | 0.203 |
| 13341.66731 | 0.203 |
| 13351.58306 | 0.203 |
| 13362.11398 | 0.203 |
| 13372.02114 | 0.203 |
| 13381.92413 | 0.203 |
| 13391.82294 | 0.202 |
| 13401.71758 | 0.202 |
| 13411.60803 | 0.202 |
| 13422.11206 | 0.202 |
| 13431.99388 | 0.202 |
| 13441.87151 | 0.202 |
| 13451.74495 | 0.202 |
| 13461.6142 | 0.202 |
| 13472.09567 | 0.202 |
| 13481.95625 | 0.202 |
| 13491.81263 | 0.202 |
| 13501.66479 | 0.202 |
| 13511.51275 | 0.202 |
| 13521.97158 | 0.202 |
| 13531.81084 | 0.202 |
| 13541.64588 | 0.202 |
| 13551.47669 | 0.202 |
| 13561.9173 | 0.202 |
| 13571.7394 | 0.202 |
| 13581.55725 | 0.202 |
| 13591.98409 | 0.202 |
| 13601.79321 | 0.202 |
| 13611.59808 | 0.202 |
| 13621.39871 | 0.202 |
| 13631.80722 | 0.202 |
| 13641.59909 | 0.202 |
| 13651.38669 | 0.202 |
| 13661.78136 | 0.202 |
| 13671.56018 | 0.202 |
| 13681.94551 | 0.202 |
| 13691.71553 | 0.202 |
| 13701.48128 | 0.202 |
| 13711.85271 | 0.202 |
| 13721.60964 | 0.202 |
| 13731.3623 | 0.202 |
| 13741.7198 | 0.202 |
| 13751.46361 | 0.202 |
| 13761.81172 | 0.202 |
| 13771.54668 | 0.202 |
| 13781.88538 | 0.202 |
| 13791.61148 | 0.202 |
| 13801.33328 | 0.202 |
| 13811.65798 | 0.202 |
| 13821.37089 | 0.202 |
| 13831.68615 | 0.202 |
| 13841.39017 | 0.202 |
| 13851.69596 | 0.202 |
| 13861.39108 | 0.202 |
| 13871.6874 | 0.202 |
| 13881.37359 | 0.202 |
| 13891.66043 | 0.202 |
| 13901.33769 | 0.202 |
| 13911.61502 | 0.202 |
| 13921.28334 | 0.202 |
| 13931.55116 | 0.202 |
| 13941.21051 | 0.202 |
| 13951.46881 | 0.202 |
| 13961.72219 | 0.202 |
| 13971.36795 | 0.202 |
| 13981.61179 | 0.202 |
| 13991.24855 | 0.202 |
| 14001.48283 | 0.202 |
| 14011.71217 | 0.202 |
| 14021.33529 | 0.202 |
| 14031.55505 | 0.202 |
| 14041.16914 | 0.202 |
| 14051.37931 | 0.202 |
| 14061.58453 | 0.202 |
| 14071.18493 | 0.202 |
| 14081.38053 | 0.202 |
| 14091.57118 | 0.202 |
| 14101.15785 | 0.201 |
| 14111.33886 | 0.201 |
| 14121.51491 | 0.201 |
| 14131.08782 | 0.201 |
| 14141.25421 | 0.201 |
| 14151.41561 | 0.201 |
| 14161.57204 | 0.201 |
| 14171.12647 | 0.201 |
| 14181.27321 | 0.201 |
| 14191.41496 | 0.201 |
| 14201.55171 | 0.201 |
| 14211.08762 | 0.201 |
| 14221.21466 | 0.201 |
| 14231.33669 | 0.201 |
| 14241.45371 | 0.201 |
| 14250.97103 | 0.201 |
| 14261.07831 | 0.201 |
| 14271.18057 | 0.201 |
| 14281.27781 | 0.201 |
| 14291.37001 | 0.201 |
| 14301.45718 | 0.201 |
| 14310.94639 | 0.201 |
| 14321.02379 | 0.201 |
| 14331.09614 | 0.201 |
| 14341.16344 | 0.201 |
| 14351.2257 | 0.201 |
| 14361.2829 | 0.201 |
| 14371.33504 | 0.201 |
| 14381.38213 | 0.201 |
| 14391.42415 | 0.201 |
| 14400.87083 | 0.201 |
| 14410.90301 | 0.201 |
| 14420.93011 | 0.201 |
| 14430.95214 | 0.201 |
| 14440.96908 | 0.201 |
| 14450.98094 | 0.201 |
| 14460.98771 | 0.201 |
| 14470.98939 | 0.201 |
| 14480.98597 | 0.201 |
| 14490.97745 | 0.201 |
| 14500.96383 | 0.201 |
| 14510.9451 | 0.201 |
| 14520.92127 | 0.201 |
| 14530.89232 | 0.201 |
| 14540.85825 | 0.201 |
| 14550.81906 | 0.201 |
| 14560.77475 | 0.201 |
| 14571.31048 | 0.201 |
| 14581.25561 | 0.201 |
| 14591.19561 | 0.201 |
| 14601.13046 | 0.201 |
| 14611.06018 | 0.201 |
| 14620.98475 | 0.201 |
| 14630.90417 | 0.201 |
| 14640.81844 | 0.201 |
| 14650.72755 | 0.201 |
| 14661.21393 | 0.201 |
| 14671.11242 | 0.201 |
| 14681.00574 | 0.201 |
| 14690.89389 | 0.201 |
| 14700.77687 | 0.201 |
| 14710.65467 | 0.201 |
| 14721.10787 | 0.201 |
| 14730.975 | 0.201 |
| 14740.83695 | 0.201 |
| 14750.6937 | 0.201 |
| 14761.12461 | 0.201 |
| 14770.97066 | 0.201 |
| 14780.81152 | 0.201 |
| 14790.64717 | 0.201 |
| 14801.05571 | 0.201 |
| 14810.88064 | 0.201 |
| 14820.70034 | 0.201 |
| 14831.09199 | 0.201 |
| 14840.90095 | 0.201 |
| 14850.70469 | 0.201 |
| 14861.07941 | 0.201 |
| 14870.87237 | 0.201 |
| 14880.6601 | 0.201 |
| 14891.01786 | 0.201 |
| 14900.7948 | 0.201 |
| 14910.56649 | 0.201 |
| 14920.90726 | 0.201 |
| 14930.66813 | 0.201 |
| 14940.99744 | 0.201 |
| 14950.74749 | 0.201 |
| 14960.49227 | 0.201 |
| 14970.80453 | 0.201 |
| 14980.53846 | 0.201 |
| 14990.83922 | 0.201 |
| 15000.56229 | 0.201 |
| 15010.85154 | 0.201 |
| 15020.56373 | 0.201 |
| 15030.84146 | 0.201 |
| 15040.54275 | 0.201 |
| 15050.80894 | 0.201 |
| 15060.49932 | 0.201 |
| 15070.75395 | 0.201 |
| 15080.43342 | 0.201 |
| 15090.67647 | 0.201 |
| 15100.91357 | 0.201 |
| 15110.57647 | 0.201 |
| 15120.80197 | 0.201 |
| 15130.45391 | 0.2 |
| 15140.6678 | 0.2 |
| 15150.87571 | 0.2 |
| 15160.51103 | 0.2 |
| 15170.70731 | 0.2 |
| 15180.33163 | 0.2 |
| 15190.51626 | 0.2 |
| 15200.69489 | 0.2 |
| 15210.30253 | 0.2 |
| 15220.4695 | 0.2 |
| 15230.63045 | 0.2 |
| 15240.78539 | 0.2 |
| 15250.37064 | 0.2 |
| 15260.51388 | 0.2 |
| 15270.65109 | 0.2 |
| 15280.78227 | 0.2 |
| 15290.34507 | 0.2 |
| 15300.46452 | 0.2 |
| 15310.57793 | 0.2 |
| 15320.6853 | 0.2 |
| 15330.22559 | 0.2 |
| 15340.32119 | 0.2 |
| 15350.41073 | 0.2 |
| 15360.49422 | 0.2 |
| 15370.57164 | 0.2 |
| 15380.64299 | 0.2 |
| 15390.70827 | 0.2 |
| 15400.20879 | 0.2 |
| 15410.26225 | 0.2 |
| 15420.30963 | 0.2 |
| 15430.35092 | 0.2 |
| 15440.38612 | 0.2 |
| 15450.41522 | 0.2 |
| 15460.43823 | 0.2 |
| 15470.45513 | 0.2 |
| 15480.46592 | 0.2 |
| 15490.4706 | 0.2 |
| 15500.46917 | 0.2 |
| 15510.46161 | 0.2 |
| 15520.44794 | 0.2 |
| 15530.42813 | 0.2 |
| 15540.4022 | 0.2 |
| 15550.37013 | 0.2 |
| 15560.33192 | 0.2 |
| 15570.28757 | 0.2 |
| 15580.23707 | 0.2 |
| 15590.18042 | 0.2 |
| 15600.11761 | 0.2 |
| 15610.04865 | 0.2 |
| 15620.52472 | 0.2 |
| 15630.44309 | 0.2 |
| 15640.35528 | 0.2 |
| 15650.2613 | 0.2 |
| 15660.16114 | 0.2 |
| 15670.0548 | 0.2 |
| 15680.4914 | 0.2 |
| 15690.37234 | 0.2 |
| 15700.24708 | 0.2 |
| 15710.11563 | 0.2 |
| 15719.97797 | 0.2 |
| 15730.38149 | 0.2 |
| 15740.23107 | 0.2 |
| 15750.07444 | 0.2 |
| 15759.91159 | 0.2 |
| 15770.2885 | 0.2 |
| 15780.11286 | 0.2 |
| 15789.93098 | 0.2 |
| 15800.2878 | 0.2 |
| 15810.09311 | 0.2 |
| 15819.89218 | 0.2 |
| 15830.22886 | 0.2 |
| 15840.01509 | 0.2 |
| 15850.33821 | 0.2 |
| 15860.11158 | 0.2 |
| 15869.87869 | 0.2 |
| 15880.18161 | 0.2 |
| 15889.93584 | 0.2 |
| 15900.22516 | 0.2 |
| 15909.96648 | 0.2 |
| 15920.24218 | 0.2 |
| 15929.97059 | 0.2 |
| 15940.23264 | 0.2 |
| 15949.94812 | 0.2 |
| 15960.19652 | 0.2 |
| 15969.89905 | 0.2 |
| 15980.13377 | 0.2 |
| 15989.82334 | 0.2 |
| 16000.04436 | 0.2 |